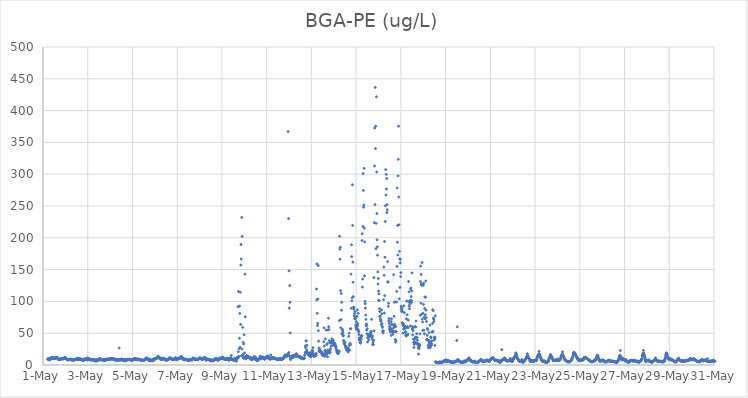
| Category | BGA-PE (ug/L) |
|---|---|
| 44317.208333333336 | 9.39 |
| 44317.21875 | 9.64 |
| 44317.229166666664 | 8.96 |
| 44317.239583333336 | 9.47 |
| 44317.25 | 9.08 |
| 44317.260416666664 | 10.12 |
| 44317.270833333336 | 9.42 |
| 44317.28125 | 8.56 |
| 44317.291666666664 | 8.02 |
| 44317.302083333336 | 8.27 |
| 44317.3125 | 8.7 |
| 44317.322916666664 | 8.48 |
| 44317.333333333336 | 9.2 |
| 44317.34375 | 9.77 |
| 44317.354166666664 | 10.43 |
| 44317.364583333336 | 11.96 |
| 44317.375 | 11.16 |
| 44317.385416666664 | 11.01 |
| 44317.395833333336 | 11.1 |
| 44317.40625 | 10.98 |
| 44317.416666666664 | 10.66 |
| 44317.427083333336 | 11.38 |
| 44317.4375 | 10.7 |
| 44317.447916666664 | 11.64 |
| 44317.458333333336 | 10.58 |
| 44317.46875 | 10.55 |
| 44317.479166666664 | 10.48 |
| 44317.489583333336 | 9.96 |
| 44317.5 | 10.61 |
| 44317.510416666664 | 10.6 |
| 44317.520833333336 | 10.1 |
| 44317.53125 | 10.48 |
| 44317.541666666664 | 10.48 |
| 44317.552083333336 | 11.65 |
| 44317.5625 | 11.7 |
| 44317.572916666664 | 11.52 |
| 44317.583333333336 | 11.71 |
| 44317.59375 | 11.9 |
| 44317.604166666664 | 12.23 |
| 44317.614583333336 | 11.11 |
| 44317.625 | 10.89 |
| 44317.635416666664 | 11.83 |
| 44317.645833333336 | 10.82 |
| 44317.65625 | 11 |
| 44317.666666666664 | 9.72 |
| 44317.677083333336 | 8.73 |
| 44317.6875 | 8.96 |
| 44317.697916666664 | 8.63 |
| 44317.708333333336 | 8.9 |
| 44317.71875 | 8.51 |
| 44317.729166666664 | 8.44 |
| 44317.739583333336 | 8.87 |
| 44317.75 | 8.63 |
| 44317.760416666664 | 8.33 |
| 44317.770833333336 | 9.34 |
| 44317.78125 | 9.35 |
| 44317.791666666664 | 10.35 |
| 44317.802083333336 | 9.73 |
| 44317.8125 | 9.58 |
| 44317.822916666664 | 9.8 |
| 44317.833333333336 | 10.14 |
| 44317.84375 | 10.01 |
| 44317.854166666664 | 9.89 |
| 44317.864583333336 | 9.53 |
| 44317.875 | 10.12 |
| 44317.885416666664 | 9.89 |
| 44317.895833333336 | 9.92 |
| 44317.90625 | 9.64 |
| 44317.916666666664 | 9.86 |
| 44317.927083333336 | 10.26 |
| 44317.9375 | 10.52 |
| 44317.947916666664 | 10.88 |
| 44317.958333333336 | 11.13 |
| 44317.96875 | 11.61 |
| 44317.979166666664 | 12.12 |
| 44317.989583333336 | 11.13 |
| 44318.0 | 10.84 |
| 44318.010416666664 | 10.72 |
| 44318.020833333336 | 10.18 |
| 44318.03125 | 10.63 |
| 44318.041666666664 | 10.05 |
| 44318.052083333336 | 9.77 |
| 44318.0625 | 9.56 |
| 44318.072916666664 | 8.69 |
| 44318.083333333336 | 8.94 |
| 44318.09375 | 8.46 |
| 44318.104166666664 | 8.33 |
| 44318.114583333336 | 8.38 |
| 44318.125 | 8.36 |
| 44318.135416666664 | 8.39 |
| 44318.145833333336 | 8.05 |
| 44318.15625 | 8.54 |
| 44318.166666666664 | 8.69 |
| 44318.177083333336 | 8.62 |
| 44318.1875 | 8.46 |
| 44318.197916666664 | 8.57 |
| 44318.208333333336 | 8.84 |
| 44318.21875 | 8.59 |
| 44318.229166666664 | 9.02 |
| 44318.239583333336 | 9.07 |
| 44318.25 | 8.12 |
| 44318.260416666664 | 8.74 |
| 44318.270833333336 | 8.68 |
| 44318.28125 | 8.13 |
| 44318.291666666664 | 7.83 |
| 44318.302083333336 | 7.79 |
| 44318.3125 | 7.96 |
| 44318.322916666664 | 7.49 |
| 44318.333333333336 | 8.03 |
| 44318.34375 | 7.77 |
| 44318.354166666664 | 7.76 |
| 44318.364583333336 | 7.58 |
| 44318.375 | 8.09 |
| 44318.385416666664 | 8.14 |
| 44318.395833333336 | 8.08 |
| 44318.40625 | 8.22 |
| 44318.416666666664 | 8.35 |
| 44318.427083333336 | 8.56 |
| 44318.4375 | 8.62 |
| 44318.447916666664 | 8.5 |
| 44318.458333333336 | 8.84 |
| 44318.46875 | 8.93 |
| 44318.479166666664 | 9.4 |
| 44318.489583333336 | 9.26 |
| 44318.5 | 9.62 |
| 44318.510416666664 | 9.72 |
| 44318.520833333336 | 9.36 |
| 44318.53125 | 10.66 |
| 44318.541666666664 | 9.24 |
| 44318.552083333336 | 9.44 |
| 44318.5625 | 8.23 |
| 44318.572916666664 | 8.8 |
| 44318.583333333336 | 9.35 |
| 44318.59375 | 9.99 |
| 44318.604166666664 | 9.1 |
| 44318.614583333336 | 9.08 |
| 44318.625 | 8.95 |
| 44318.635416666664 | 10.34 |
| 44318.645833333336 | 10.04 |
| 44318.65625 | 8.89 |
| 44318.666666666664 | 9.01 |
| 44318.677083333336 | 9.17 |
| 44318.6875 | 9.08 |
| 44318.697916666664 | 8.51 |
| 44318.708333333336 | 9.04 |
| 44318.71875 | 8.16 |
| 44318.729166666664 | 8.19 |
| 44318.739583333336 | 8.38 |
| 44318.75 | 8.14 |
| 44318.760416666664 | 7.8 |
| 44318.770833333336 | 8.87 |
| 44318.78125 | 8.46 |
| 44318.791666666664 | 9.16 |
| 44318.802083333336 | 7.08 |
| 44318.8125 | 8.73 |
| 44318.822916666664 | 8 |
| 44318.833333333336 | 7.89 |
| 44318.84375 | 9.18 |
| 44318.854166666664 | 9.13 |
| 44318.864583333336 | 8.08 |
| 44318.875 | 8.87 |
| 44318.885416666664 | 8.41 |
| 44318.895833333336 | 9.21 |
| 44318.90625 | 9.56 |
| 44318.916666666664 | 8.64 |
| 44318.927083333336 | 9.68 |
| 44318.9375 | 9.77 |
| 44318.947916666664 | 8.84 |
| 44318.958333333336 | 8.89 |
| 44318.96875 | 8.18 |
| 44318.979166666664 | 8.05 |
| 44318.989583333336 | 9.42 |
| 44319.0 | 11.28 |
| 44319.010416666664 | 10.03 |
| 44319.020833333336 | 10.27 |
| 44319.03125 | 9.99 |
| 44319.041666666664 | 9.34 |
| 44319.052083333336 | 9.57 |
| 44319.0625 | 8.93 |
| 44319.072916666664 | 8.22 |
| 44319.083333333336 | 9.4 |
| 44319.09375 | 9.24 |
| 44319.104166666664 | 8.79 |
| 44319.114583333336 | 8.56 |
| 44319.125 | 8.31 |
| 44319.135416666664 | 8.27 |
| 44319.145833333336 | 7.91 |
| 44319.15625 | 8.67 |
| 44319.166666666664 | 8.33 |
| 44319.177083333336 | 8.33 |
| 44319.1875 | 7.9 |
| 44319.197916666664 | 8.51 |
| 44319.208333333336 | 8.45 |
| 44319.21875 | 8.1 |
| 44319.229166666664 | 7.92 |
| 44319.239583333336 | 7.9 |
| 44319.25 | 7.92 |
| 44319.260416666664 | 8 |
| 44319.270833333336 | 7.72 |
| 44319.28125 | 8.25 |
| 44319.291666666664 | 8.02 |
| 44319.302083333336 | 7.67 |
| 44319.3125 | 7.74 |
| 44319.322916666664 | 7.67 |
| 44319.333333333336 | 6.54 |
| 44319.34375 | 7.55 |
| 44319.354166666664 | 7.79 |
| 44319.364583333336 | 5.83 |
| 44319.375 | 6.29 |
| 44319.385416666664 | 7.89 |
| 44319.395833333336 | 7.67 |
| 44319.40625 | 7.71 |
| 44319.416666666664 | 7.5 |
| 44319.427083333336 | 7.12 |
| 44319.4375 | 7.43 |
| 44319.447916666664 | 8.74 |
| 44319.458333333336 | 7.86 |
| 44319.46875 | 8.62 |
| 44319.479166666664 | 7.14 |
| 44319.489583333336 | 7.91 |
| 44319.5 | 9.04 |
| 44319.510416666664 | 9.52 |
| 44319.520833333336 | 9.45 |
| 44319.53125 | 9.75 |
| 44319.541666666664 | 9.85 |
| 44319.552083333336 | 9.77 |
| 44319.5625 | 9.92 |
| 44319.572916666664 | 9.69 |
| 44319.583333333336 | 8.22 |
| 44319.59375 | 8.35 |
| 44319.604166666664 | 7.99 |
| 44319.614583333336 | 8.07 |
| 44319.625 | 8.51 |
| 44319.635416666664 | 8.67 |
| 44319.645833333336 | 8.55 |
| 44319.65625 | 8.6 |
| 44319.666666666664 | 8.69 |
| 44319.677083333336 | 8.37 |
| 44319.6875 | 7.35 |
| 44319.697916666664 | 8.14 |
| 44319.708333333336 | 8.59 |
| 44319.71875 | 7.12 |
| 44319.729166666664 | 8.96 |
| 44319.739583333336 | 7.57 |
| 44319.75 | 7.39 |
| 44319.760416666664 | 6.94 |
| 44319.770833333336 | 7.99 |
| 44319.78125 | 7.23 |
| 44319.791666666664 | 7.81 |
| 44319.802083333336 | 7.6 |
| 44319.8125 | 7.93 |
| 44319.822916666664 | 8.99 |
| 44319.833333333336 | 8.84 |
| 44319.84375 | 9.17 |
| 44319.854166666664 | 9.12 |
| 44319.864583333336 | 8.51 |
| 44319.875 | 8.65 |
| 44319.885416666664 | 9.39 |
| 44319.895833333336 | 9.08 |
| 44319.90625 | 8.7 |
| 44319.916666666664 | 8.89 |
| 44319.927083333336 | 9.42 |
| 44319.9375 | 9.2 |
| 44319.947916666664 | 9.15 |
| 44319.958333333336 | 8.75 |
| 44319.96875 | 8.64 |
| 44319.979166666664 | 8.95 |
| 44319.989583333336 | 9.15 |
| 44320.0 | 9.46 |
| 44320.010416666664 | 10.17 |
| 44320.020833333336 | 10.05 |
| 44320.03125 | 10.26 |
| 44320.041666666664 | 9.76 |
| 44320.052083333336 | 9.65 |
| 44320.0625 | 9.62 |
| 44320.072916666664 | 9.64 |
| 44320.083333333336 | 9.24 |
| 44320.09375 | 9.47 |
| 44320.104166666664 | 9.56 |
| 44320.114583333336 | 9.75 |
| 44320.125 | 9.95 |
| 44320.135416666664 | 9.76 |
| 44320.145833333336 | 9.8 |
| 44320.15625 | 9.54 |
| 44320.166666666664 | 9.5 |
| 44320.177083333336 | 9.39 |
| 44320.1875 | 9.14 |
| 44320.197916666664 | 8.07 |
| 44320.208333333336 | 8.31 |
| 44320.21875 | 9.21 |
| 44320.229166666664 | 7.89 |
| 44320.239583333336 | 8.63 |
| 44320.25 | 7.59 |
| 44320.260416666664 | 8.52 |
| 44320.270833333336 | 9 |
| 44320.28125 | 8.43 |
| 44320.291666666664 | 7.21 |
| 44320.302083333336 | 7.97 |
| 44320.3125 | 7.82 |
| 44320.322916666664 | 7.57 |
| 44320.333333333336 | 8.55 |
| 44320.34375 | 8.37 |
| 44320.354166666664 | 8.14 |
| 44320.364583333336 | 7.91 |
| 44320.375 | 8.23 |
| 44320.385416666664 | 8.02 |
| 44320.395833333336 | 8.25 |
| 44320.40625 | 26.69 |
| 44320.416666666664 | 8.24 |
| 44320.427083333336 | 8.23 |
| 44320.4375 | 7.66 |
| 44320.447916666664 | 7.56 |
| 44320.458333333336 | 7.82 |
| 44320.46875 | 8.31 |
| 44320.479166666664 | 8.38 |
| 44320.489583333336 | 8.52 |
| 44320.5 | 8.95 |
| 44320.510416666664 | 9.39 |
| 44320.520833333336 | 9.39 |
| 44320.53125 | 8.98 |
| 44320.541666666664 | 8.19 |
| 44320.552083333336 | 8.09 |
| 44320.5625 | 7.14 |
| 44320.572916666664 | 8.58 |
| 44320.583333333336 | 8.03 |
| 44320.59375 | 7.93 |
| 44320.604166666664 | 8.01 |
| 44320.614583333336 | 8.45 |
| 44320.625 | 7.73 |
| 44320.635416666664 | 7.51 |
| 44320.645833333336 | 7.84 |
| 44320.65625 | 6.72 |
| 44320.666666666664 | 7.82 |
| 44320.677083333336 | 6.4 |
| 44320.6875 | 7.2 |
| 44320.697916666664 | 8.9 |
| 44320.708333333336 | 7.66 |
| 44320.71875 | 8.07 |
| 44320.729166666664 | 7.39 |
| 44320.739583333336 | 8.44 |
| 44320.75 | 7.53 |
| 44320.760416666664 | 8.5 |
| 44320.770833333336 | 8.88 |
| 44320.78125 | 8.29 |
| 44320.791666666664 | 8.65 |
| 44320.802083333336 | 8.51 |
| 44320.8125 | 8.65 |
| 44320.822916666664 | 8.65 |
| 44320.833333333336 | 8.71 |
| 44320.84375 | 8.76 |
| 44320.854166666664 | 8.9 |
| 44320.864583333336 | 9.4 |
| 44320.875 | 8.18 |
| 44320.885416666664 | 8.29 |
| 44320.895833333336 | 8.45 |
| 44320.90625 | 8.22 |
| 44320.916666666664 | 8.6 |
| 44320.927083333336 | 8.5 |
| 44320.9375 | 8.54 |
| 44320.947916666664 | 7.93 |
| 44320.958333333336 | 8.3 |
| 44320.96875 | 6.59 |
| 44320.979166666664 | 6.88 |
| 44320.989583333336 | 8.51 |
| 44321.0 | 7.9 |
| 44321.010416666664 | 8.58 |
| 44321.020833333336 | 8.42 |
| 44321.03125 | 8.62 |
| 44321.041666666664 | 8.89 |
| 44321.052083333336 | 9.07 |
| 44321.0625 | 9.32 |
| 44321.072916666664 | 9.48 |
| 44321.083333333336 | 9.5 |
| 44321.09375 | 10.14 |
| 44321.104166666664 | 10.39 |
| 44321.114583333336 | 9.22 |
| 44321.125 | 9.02 |
| 44321.135416666664 | 9.12 |
| 44321.145833333336 | 9.17 |
| 44321.15625 | 8.56 |
| 44321.166666666664 | 9.28 |
| 44321.177083333336 | 8.74 |
| 44321.1875 | 9.49 |
| 44321.197916666664 | 9.09 |
| 44321.208333333336 | 9.22 |
| 44321.21875 | 9.21 |
| 44321.229166666664 | 9.13 |
| 44321.239583333336 | 7.6 |
| 44321.25 | 9.34 |
| 44321.260416666664 | 8.93 |
| 44321.270833333336 | 8.8 |
| 44321.28125 | 8.81 |
| 44321.291666666664 | 8.92 |
| 44321.302083333336 | 8.63 |
| 44321.3125 | 8.67 |
| 44321.322916666664 | 8.28 |
| 44321.333333333336 | 8.47 |
| 44321.34375 | 8.45 |
| 44321.354166666664 | 8.48 |
| 44321.364583333336 | 8.14 |
| 44321.375 | 7.25 |
| 44321.385416666664 | 7.36 |
| 44321.395833333336 | 7.28 |
| 44321.40625 | 7.7 |
| 44321.416666666664 | 7.7 |
| 44321.427083333336 | 7.21 |
| 44321.4375 | 7.4 |
| 44321.447916666664 | 7.32 |
| 44321.458333333336 | 7.07 |
| 44321.46875 | 7.3 |
| 44321.479166666664 | 7.49 |
| 44321.489583333336 | 7.37 |
| 44321.5 | 7.35 |
| 44321.510416666664 | 7.54 |
| 44321.520833333336 | 7.61 |
| 44321.53125 | 7.99 |
| 44321.541666666664 | 8.53 |
| 44321.552083333336 | 8.78 |
| 44321.5625 | 8.44 |
| 44321.572916666664 | 9.69 |
| 44321.583333333336 | 9.66 |
| 44321.59375 | 9.13 |
| 44321.604166666664 | 10.03 |
| 44321.614583333336 | 9.61 |
| 44321.625 | 11.25 |
| 44321.635416666664 | 10.17 |
| 44321.645833333336 | 10.94 |
| 44321.65625 | 10.01 |
| 44321.666666666664 | 9.87 |
| 44321.677083333336 | 8.99 |
| 44321.6875 | 9.14 |
| 44321.697916666664 | 8.61 |
| 44321.708333333336 | 8.33 |
| 44321.71875 | 8.37 |
| 44321.729166666664 | 9.06 |
| 44321.739583333336 | 6.73 |
| 44321.75 | 8.88 |
| 44321.760416666664 | 8.2 |
| 44321.770833333336 | 9.14 |
| 44321.78125 | 9.18 |
| 44321.791666666664 | 7.44 |
| 44321.802083333336 | 6.64 |
| 44321.8125 | 6.59 |
| 44321.822916666664 | 6.48 |
| 44321.833333333336 | 7.14 |
| 44321.84375 | 7.12 |
| 44321.854166666664 | 6.98 |
| 44321.864583333336 | 7.42 |
| 44321.875 | 8.03 |
| 44321.885416666664 | 6.97 |
| 44321.895833333336 | 7.14 |
| 44321.90625 | 7.97 |
| 44321.916666666664 | 8.5 |
| 44321.927083333336 | 8.47 |
| 44321.9375 | 6.65 |
| 44321.947916666664 | 8.88 |
| 44321.958333333336 | 9.26 |
| 44321.96875 | 9.87 |
| 44321.979166666664 | 9.58 |
| 44321.989583333336 | 10 |
| 44322.0 | 9.05 |
| 44322.010416666664 | 10 |
| 44322.020833333336 | 9.99 |
| 44322.03125 | 9.52 |
| 44322.041666666664 | 9.77 |
| 44322.052083333336 | 10.06 |
| 44322.0625 | 10.43 |
| 44322.072916666664 | 10.48 |
| 44322.083333333336 | 10.69 |
| 44322.09375 | 11.31 |
| 44322.104166666664 | 11.33 |
| 44322.114583333336 | 11.55 |
| 44322.125 | 12.28 |
| 44322.135416666664 | 12.04 |
| 44322.145833333336 | 14.06 |
| 44322.15625 | 13.2 |
| 44322.166666666664 | 12.83 |
| 44322.177083333336 | 11.93 |
| 44322.1875 | 11.11 |
| 44322.197916666664 | 10.93 |
| 44322.208333333336 | 10.69 |
| 44322.21875 | 10.77 |
| 44322.229166666664 | 9.99 |
| 44322.239583333336 | 9.17 |
| 44322.25 | 10.74 |
| 44322.260416666664 | 10.67 |
| 44322.270833333336 | 10.58 |
| 44322.28125 | 10.1 |
| 44322.291666666664 | 8.63 |
| 44322.302083333336 | 8.94 |
| 44322.3125 | 10.47 |
| 44322.322916666664 | 9.86 |
| 44322.333333333336 | 10.18 |
| 44322.34375 | 8.82 |
| 44322.354166666664 | 10.5 |
| 44322.364583333336 | 9.6 |
| 44322.375 | 10.34 |
| 44322.385416666664 | 9.68 |
| 44322.395833333336 | 9.64 |
| 44322.40625 | 9.99 |
| 44322.416666666664 | 10.17 |
| 44322.427083333336 | 9.89 |
| 44322.4375 | 9.72 |
| 44322.447916666664 | 9.22 |
| 44322.458333333336 | 8.77 |
| 44322.46875 | 8.04 |
| 44322.479166666664 | 8.74 |
| 44322.489583333336 | 8.37 |
| 44322.5 | 7.48 |
| 44322.510416666664 | 7.54 |
| 44322.520833333336 | 7.63 |
| 44322.53125 | 7.57 |
| 44322.541666666664 | 7.35 |
| 44322.552083333336 | 9 |
| 44322.5625 | 8.6 |
| 44322.572916666664 | 8.56 |
| 44322.583333333336 | 8.83 |
| 44322.59375 | 8.96 |
| 44322.604166666664 | 9.72 |
| 44322.614583333336 | 9.04 |
| 44322.625 | 9.23 |
| 44322.635416666664 | 9.4 |
| 44322.645833333336 | 10.45 |
| 44322.65625 | 10.19 |
| 44322.666666666664 | 11.75 |
| 44322.677083333336 | 10.31 |
| 44322.6875 | 10.37 |
| 44322.697916666664 | 10.81 |
| 44322.708333333336 | 10.44 |
| 44322.71875 | 10.28 |
| 44322.729166666664 | 10.39 |
| 44322.739583333336 | 9.85 |
| 44322.75 | 9.69 |
| 44322.760416666664 | 8.72 |
| 44322.770833333336 | 9.08 |
| 44322.78125 | 9.66 |
| 44322.791666666664 | 8.78 |
| 44322.802083333336 | 9.05 |
| 44322.8125 | 8.43 |
| 44322.822916666664 | 8.45 |
| 44322.833333333336 | 8.49 |
| 44322.84375 | 9.12 |
| 44322.854166666664 | 8.74 |
| 44322.864583333336 | 9.5 |
| 44322.875 | 9.36 |
| 44322.885416666664 | 9.57 |
| 44322.895833333336 | 9.27 |
| 44322.90625 | 10.07 |
| 44322.916666666664 | 9.29 |
| 44322.927083333336 | 11.81 |
| 44322.9375 | 10.36 |
| 44322.947916666664 | 9.69 |
| 44322.958333333336 | 9.78 |
| 44322.96875 | 9.54 |
| 44322.979166666664 | 8.15 |
| 44322.989583333336 | 8.31 |
| 44323.0 | 9.38 |
| 44323.010416666664 | 9.95 |
| 44323.020833333336 | 10.2 |
| 44323.03125 | 10.37 |
| 44323.041666666664 | 11 |
| 44323.052083333336 | 9.66 |
| 44323.0625 | 9.82 |
| 44323.072916666664 | 10.38 |
| 44323.083333333336 | 10.25 |
| 44323.09375 | 10.97 |
| 44323.104166666664 | 10.55 |
| 44323.114583333336 | 10.79 |
| 44323.125 | 10.72 |
| 44323.135416666664 | 10.96 |
| 44323.145833333336 | 11.46 |
| 44323.15625 | 11.03 |
| 44323.166666666664 | 11.79 |
| 44323.177083333336 | 13.34 |
| 44323.1875 | 13.35 |
| 44323.197916666664 | 12.2 |
| 44323.208333333336 | 11.22 |
| 44323.21875 | 11.35 |
| 44323.229166666664 | 10.44 |
| 44323.239583333336 | 10.16 |
| 44323.25 | 10.44 |
| 44323.260416666664 | 9.45 |
| 44323.270833333336 | 9.44 |
| 44323.28125 | 8.37 |
| 44323.291666666664 | 9.7 |
| 44323.302083333336 | 9.33 |
| 44323.3125 | 9.14 |
| 44323.322916666664 | 7.82 |
| 44323.333333333336 | 9.36 |
| 44323.34375 | 8.84 |
| 44323.354166666664 | 8.76 |
| 44323.364583333336 | 8.41 |
| 44323.375 | 8.89 |
| 44323.385416666664 | 8.83 |
| 44323.395833333336 | 8.42 |
| 44323.40625 | 8.85 |
| 44323.416666666664 | 8.85 |
| 44323.427083333336 | 7.85 |
| 44323.4375 | 7.98 |
| 44323.447916666664 | 8.14 |
| 44323.458333333336 | 7.87 |
| 44323.46875 | 7.76 |
| 44323.479166666664 | 7.3 |
| 44323.489583333336 | 7.53 |
| 44323.5 | 8.06 |
| 44323.510416666664 | 7.41 |
| 44323.520833333336 | 7.56 |
| 44323.53125 | 8.02 |
| 44323.541666666664 | 7.88 |
| 44323.552083333336 | 7.4 |
| 44323.5625 | 7.96 |
| 44323.572916666664 | 7.93 |
| 44323.583333333336 | 8.31 |
| 44323.59375 | 8.26 |
| 44323.604166666664 | 8.78 |
| 44323.614583333336 | 8.92 |
| 44323.625 | 8.65 |
| 44323.635416666664 | 8.29 |
| 44323.645833333336 | 8.66 |
| 44323.65625 | 7.76 |
| 44323.666666666664 | 7.74 |
| 44323.677083333336 | 9.05 |
| 44323.6875 | 9.5 |
| 44323.697916666664 | 11.15 |
| 44323.708333333336 | 10.29 |
| 44323.71875 | 10.16 |
| 44323.729166666664 | 10.2 |
| 44323.739583333336 | 10.15 |
| 44323.75 | 10.54 |
| 44323.760416666664 | 10.25 |
| 44323.770833333336 | 9.97 |
| 44323.78125 | 9.49 |
| 44323.791666666664 | 8.95 |
| 44323.802083333336 | 8.96 |
| 44323.8125 | 9.16 |
| 44323.822916666664 | 8.91 |
| 44323.833333333336 | 8.56 |
| 44323.84375 | 9.24 |
| 44323.854166666664 | 9.02 |
| 44323.864583333336 | 9.17 |
| 44323.875 | 8.71 |
| 44323.885416666664 | 8.9 |
| 44323.895833333336 | 8.94 |
| 44323.90625 | 8.96 |
| 44323.916666666664 | 8.58 |
| 44323.927083333336 | 8.73 |
| 44323.9375 | 9.02 |
| 44323.947916666664 | 8.97 |
| 44323.958333333336 | 9.55 |
| 44323.96875 | 10.14 |
| 44323.979166666664 | 10.58 |
| 44323.989583333336 | 10.17 |
| 44324.0 | 11.42 |
| 44324.010416666664 | 10.42 |
| 44324.020833333336 | 10.49 |
| 44324.03125 | 10.42 |
| 44324.041666666664 | 10.47 |
| 44324.052083333336 | 10.58 |
| 44324.0625 | 10.77 |
| 44324.072916666664 | 10.42 |
| 44324.083333333336 | 8.7 |
| 44324.09375 | 9.58 |
| 44324.104166666664 | 10.24 |
| 44324.114583333336 | 9.77 |
| 44324.125 | 10.02 |
| 44324.135416666664 | 9.06 |
| 44324.145833333336 | 9.69 |
| 44324.15625 | 9.21 |
| 44324.166666666664 | 9.94 |
| 44324.177083333336 | 9.95 |
| 44324.1875 | 9.58 |
| 44324.197916666664 | 10.21 |
| 44324.208333333336 | 11.94 |
| 44324.21875 | 11.43 |
| 44324.229166666664 | 11.08 |
| 44324.239583333336 | 11.02 |
| 44324.25 | 11.13 |
| 44324.260416666664 | 10.35 |
| 44324.270833333336 | 10.05 |
| 44324.28125 | 9.8 |
| 44324.291666666664 | 7.83 |
| 44324.302083333336 | 7.46 |
| 44324.3125 | 8.33 |
| 44324.322916666664 | 8.9 |
| 44324.333333333336 | 9.27 |
| 44324.34375 | 8.92 |
| 44324.354166666664 | 9.1 |
| 44324.364583333336 | 8.94 |
| 44324.375 | 8.64 |
| 44324.385416666664 | 8.89 |
| 44324.395833333336 | 8.83 |
| 44324.40625 | 8.39 |
| 44324.416666666664 | 8.39 |
| 44324.427083333336 | 8.43 |
| 44324.4375 | 8.23 |
| 44324.447916666664 | 8.1 |
| 44324.458333333336 | 6.89 |
| 44324.46875 | 7.52 |
| 44324.479166666664 | 7.68 |
| 44324.489583333336 | 7.75 |
| 44324.5 | 7.6 |
| 44324.510416666664 | 7.62 |
| 44324.520833333336 | 7.26 |
| 44324.53125 | 7.64 |
| 44324.541666666664 | 6.73 |
| 44324.552083333336 | 8.11 |
| 44324.5625 | 7.58 |
| 44324.572916666664 | 6.42 |
| 44324.583333333336 | 6.92 |
| 44324.59375 | 7.03 |
| 44324.604166666664 | 7.39 |
| 44324.614583333336 | 7.52 |
| 44324.625 | 7.75 |
| 44324.635416666664 | 8.33 |
| 44324.645833333336 | 8.01 |
| 44324.65625 | 8.17 |
| 44324.666666666664 | 8.38 |
| 44324.677083333336 | 7.89 |
| 44324.6875 | 8.92 |
| 44324.697916666664 | 9.54 |
| 44324.708333333336 | 10.06 |
| 44324.71875 | 8.78 |
| 44324.729166666664 | 9.71 |
| 44324.739583333336 | 9.54 |
| 44324.75 | 10.37 |
| 44324.760416666664 | 9.57 |
| 44324.770833333336 | 8.84 |
| 44324.78125 | 8.92 |
| 44324.791666666664 | 8.31 |
| 44324.802083333336 | 8.08 |
| 44324.8125 | 8.01 |
| 44324.822916666664 | 7.93 |
| 44324.833333333336 | 8.14 |
| 44324.84375 | 7.81 |
| 44324.854166666664 | 7.91 |
| 44324.864583333336 | 8.59 |
| 44324.875 | 10.13 |
| 44324.885416666664 | 10.55 |
| 44324.895833333336 | 10.37 |
| 44324.90625 | 9.96 |
| 44324.916666666664 | 10.05 |
| 44324.927083333336 | 10.06 |
| 44324.9375 | 9.81 |
| 44324.947916666664 | 10.55 |
| 44324.958333333336 | 10.68 |
| 44324.96875 | 10.89 |
| 44324.979166666664 | 10.62 |
| 44324.989583333336 | 11.21 |
| 44325.0 | 11.43 |
| 44325.010416666664 | 12.55 |
| 44325.020833333336 | 9.96 |
| 44325.03125 | 11.33 |
| 44325.041666666664 | 11.61 |
| 44325.052083333336 | 11.2 |
| 44325.0625 | 10.02 |
| 44325.072916666664 | 10.69 |
| 44325.083333333336 | 10.03 |
| 44325.09375 | 9.27 |
| 44325.104166666664 | 10.13 |
| 44325.114583333336 | 8.76 |
| 44325.125 | 9.51 |
| 44325.135416666664 | 9.26 |
| 44325.145833333336 | 8.97 |
| 44325.15625 | 9.14 |
| 44325.166666666664 | 8.94 |
| 44325.177083333336 | 9.21 |
| 44325.1875 | 9.25 |
| 44325.197916666664 | 9.28 |
| 44325.208333333336 | 9.91 |
| 44325.21875 | 9.22 |
| 44325.229166666664 | 9.03 |
| 44325.239583333336 | 8.64 |
| 44325.25 | 9.17 |
| 44325.260416666664 | 10.91 |
| 44325.270833333336 | 9.49 |
| 44325.28125 | 9.54 |
| 44325.291666666664 | 8.7 |
| 44325.302083333336 | 7.93 |
| 44325.3125 | 7.46 |
| 44325.322916666664 | 7.97 |
| 44325.333333333336 | 8.37 |
| 44325.34375 | 9.74 |
| 44325.354166666664 | 10.75 |
| 44325.364583333336 | 9.31 |
| 44325.375 | 9.92 |
| 44325.385416666664 | 10.1 |
| 44325.395833333336 | 10.25 |
| 44325.40625 | 10.85 |
| 44325.416666666664 | 14.81 |
| 44325.427083333336 | 10.08 |
| 44325.4375 | 9.54 |
| 44325.447916666664 | 9.17 |
| 44325.458333333336 | 9.07 |
| 44325.46875 | 8.17 |
| 44325.479166666664 | 8.41 |
| 44325.489583333336 | 8.59 |
| 44325.5 | 8.1 |
| 44325.510416666664 | 8.09 |
| 44325.520833333336 | 7.75 |
| 44325.53125 | 7.47 |
| 44325.541666666664 | 7.63 |
| 44325.552083333336 | 8 |
| 44325.5625 | 8.15 |
| 44325.572916666664 | 10.79 |
| 44325.583333333336 | 8.32 |
| 44325.59375 | 8.58 |
| 44325.604166666664 | 7.84 |
| 44325.614583333336 | 7.53 |
| 44325.625 | 6.17 |
| 44325.635416666664 | 6.53 |
| 44325.645833333336 | 6.42 |
| 44325.65625 | 10.03 |
| 44325.666666666664 | 9.48 |
| 44325.677083333336 | 10.43 |
| 44325.6875 | 11.86 |
| 44325.697916666664 | 12.06 |
| 44325.708333333336 | 10.51 |
| 44325.71875 | 91.68 |
| 44325.729166666664 | 20.78 |
| 44325.739583333336 | 115.43 |
| 44325.75 | 13.5 |
| 44325.760416666664 | 12.84 |
| 44325.770833333336 | 25.71 |
| 44325.78125 | 42.04 |
| 44325.791666666664 | 92.45 |
| 44325.802083333336 | 81.07 |
| 44325.8125 | 27.67 |
| 44325.822916666664 | 114.4 |
| 44325.833333333336 | 63.78 |
| 44325.84375 | 157.18 |
| 44325.854166666664 | 189.46 |
| 44325.864583333336 | 166.7 |
| 44325.875 | 14.45 |
| 44325.885416666664 | 232.07 |
| 44325.895833333336 | 25.12 |
| 44325.90625 | 202.11 |
| 44325.916666666664 | 15.08 |
| 44325.927083333336 | 59.18 |
| 44325.9375 | 16.49 |
| 44325.947916666664 | 35.67 |
| 44325.958333333336 | 10.73 |
| 44325.96875 | 11.36 |
| 44325.979166666664 | 32.94 |
| 44325.989583333336 | 47.65 |
| 44326.0 | 11.47 |
| 44326.010416666664 | 19.05 |
| 44326.020833333336 | 12.42 |
| 44326.03125 | 142.81 |
| 44326.041666666664 | 75.79 |
| 44326.052083333336 | 11.66 |
| 44326.0625 | 9.56 |
| 44326.072916666664 | 12.07 |
| 44326.083333333336 | 12.13 |
| 44326.09375 | 14.48 |
| 44326.104166666664 | 14.92 |
| 44326.114583333336 | 13.04 |
| 44326.125 | 11.71 |
| 44326.135416666664 | 12.42 |
| 44326.145833333336 | 11.72 |
| 44326.15625 | 14.04 |
| 44326.166666666664 | 12.32 |
| 44326.177083333336 | 13.23 |
| 44326.1875 | 12.06 |
| 44326.197916666664 | 11.8 |
| 44326.208333333336 | 12.28 |
| 44326.21875 | 11.76 |
| 44326.229166666664 | 11.11 |
| 44326.239583333336 | 11.25 |
| 44326.25 | 12.11 |
| 44326.260416666664 | 12.15 |
| 44326.270833333336 | 9.62 |
| 44326.28125 | 9.21 |
| 44326.291666666664 | 11.11 |
| 44326.302083333336 | 10.68 |
| 44326.3125 | 9.99 |
| 44326.322916666664 | 10.68 |
| 44326.333333333336 | 8.17 |
| 44326.34375 | 8.39 |
| 44326.354166666664 | 8.88 |
| 44326.364583333336 | 10.6 |
| 44326.375 | 10.07 |
| 44326.385416666664 | 9.9 |
| 44326.395833333336 | 10.03 |
| 44326.40625 | 10.44 |
| 44326.416666666664 | 10.17 |
| 44326.427083333336 | 9.99 |
| 44326.4375 | 13.24 |
| 44326.447916666664 | 9.79 |
| 44326.458333333336 | 9.4 |
| 44326.46875 | 9.4 |
| 44326.479166666664 | 9.93 |
| 44326.489583333336 | 12.66 |
| 44326.5 | 10.25 |
| 44326.510416666664 | 11.23 |
| 44326.520833333336 | 9.68 |
| 44326.53125 | 8.44 |
| 44326.541666666664 | 9.64 |
| 44326.552083333336 | 7.12 |
| 44326.5625 | 7.83 |
| 44326.572916666664 | 7.41 |
| 44326.583333333336 | 8.05 |
| 44326.59375 | 6.9 |
| 44326.604166666664 | 7.37 |
| 44326.614583333336 | 7.83 |
| 44326.625 | 9.13 |
| 44326.635416666664 | 8.61 |
| 44326.645833333336 | 9.63 |
| 44326.65625 | 9.89 |
| 44326.666666666664 | 10.18 |
| 44326.677083333336 | 9.58 |
| 44326.6875 | 11.07 |
| 44326.697916666664 | 11.23 |
| 44326.708333333336 | 13.98 |
| 44326.71875 | 11.89 |
| 44326.729166666664 | 11.66 |
| 44326.739583333336 | 12.04 |
| 44326.75 | 11.21 |
| 44326.760416666664 | 11.43 |
| 44326.770833333336 | 9.79 |
| 44326.78125 | 11.42 |
| 44326.791666666664 | 12.8 |
| 44326.802083333336 | 12.45 |
| 44326.8125 | 11.44 |
| 44326.822916666664 | 11.71 |
| 44326.833333333336 | 11.28 |
| 44326.84375 | 11.3 |
| 44326.854166666664 | 12.42 |
| 44326.864583333336 | 11.77 |
| 44326.875 | 10.44 |
| 44326.885416666664 | 10.7 |
| 44326.895833333336 | 10.12 |
| 44326.90625 | 9.43 |
| 44326.916666666664 | 9.22 |
| 44326.927083333336 | 9.95 |
| 44326.9375 | 10.63 |
| 44326.947916666664 | 12.04 |
| 44326.958333333336 | 10.81 |
| 44326.96875 | 11.94 |
| 44326.979166666664 | 11.49 |
| 44326.989583333336 | 11.78 |
| 44327.0 | 13.03 |
| 44327.010416666664 | 12.99 |
| 44327.020833333336 | 14.08 |
| 44327.03125 | 12.96 |
| 44327.041666666664 | 12.23 |
| 44327.052083333336 | 13.89 |
| 44327.0625 | 10.65 |
| 44327.072916666664 | 13.03 |
| 44327.083333333336 | 13.63 |
| 44327.09375 | 11.61 |
| 44327.104166666664 | 10.5 |
| 44327.114583333336 | 11.01 |
| 44327.125 | 11.14 |
| 44327.135416666664 | 10.23 |
| 44327.145833333336 | 9.74 |
| 44327.15625 | 8.94 |
| 44327.166666666664 | 9.62 |
| 44327.177083333336 | 9.19 |
| 44327.1875 | 15.84 |
| 44327.197916666664 | 10.88 |
| 44327.208333333336 | 11.18 |
| 44327.21875 | 10.63 |
| 44327.229166666664 | 11.35 |
| 44327.239583333336 | 11.36 |
| 44327.25 | 10.99 |
| 44327.260416666664 | 11.63 |
| 44327.270833333336 | 11.16 |
| 44327.28125 | 11.14 |
| 44327.291666666664 | 11.12 |
| 44327.302083333336 | 9.96 |
| 44327.3125 | 11.27 |
| 44327.322916666664 | 11.14 |
| 44327.333333333336 | 10.7 |
| 44327.34375 | 10.95 |
| 44327.354166666664 | 9.89 |
| 44327.364583333336 | 10.33 |
| 44327.375 | 10.14 |
| 44327.385416666664 | 10.28 |
| 44327.395833333336 | 10.2 |
| 44327.40625 | 9.93 |
| 44327.416666666664 | 10.17 |
| 44327.427083333336 | 9.92 |
| 44327.4375 | 9.43 |
| 44327.447916666664 | 8.83 |
| 44327.458333333336 | 9 |
| 44327.46875 | 8.54 |
| 44327.479166666664 | 8.81 |
| 44327.489583333336 | 8.43 |
| 44327.5 | 8.34 |
| 44327.510416666664 | 8.8 |
| 44327.520833333336 | 8.8 |
| 44327.53125 | 9.74 |
| 44327.541666666664 | 9.64 |
| 44327.552083333336 | 9.59 |
| 44327.5625 | 9.97 |
| 44327.572916666664 | 9.47 |
| 44327.583333333336 | 10.03 |
| 44327.59375 | 9.74 |
| 44327.604166666664 | 8.57 |
| 44327.614583333336 | 9.23 |
| 44327.625 | 9.88 |
| 44327.635416666664 | 9.91 |
| 44327.645833333336 | 8.89 |
| 44327.65625 | 8.71 |
| 44327.666666666664 | 8.6 |
| 44327.677083333336 | 9.55 |
| 44327.6875 | 8.58 |
| 44327.697916666664 | 9.34 |
| 44327.708333333336 | 9.38 |
| 44327.71875 | 10.14 |
| 44327.729166666664 | 10.73 |
| 44327.739583333336 | 9.97 |
| 44327.75 | 10.49 |
| 44327.760416666664 | 11.76 |
| 44327.770833333336 | 10.74 |
| 44327.78125 | 12.62 |
| 44327.791666666664 | 12.66 |
| 44327.802083333336 | 14.33 |
| 44327.8125 | 14.79 |
| 44327.822916666664 | 14.43 |
| 44327.833333333336 | 14.04 |
| 44327.84375 | 14.28 |
| 44327.854166666664 | 15.59 |
| 44327.864583333336 | 14.45 |
| 44327.875 | 14.59 |
| 44327.885416666664 | 15.81 |
| 44327.895833333336 | 14.54 |
| 44327.90625 | 13.73 |
| 44327.916666666664 | 15.08 |
| 44327.927083333336 | 14.33 |
| 44327.9375 | 16.52 |
| 44327.947916666664 | 14.85 |
| 44327.958333333336 | 367.02 |
| 44327.96875 | 16.98 |
| 44327.979166666664 | 230.15 |
| 44327.989583333336 | 19.58 |
| 44328.0 | 147.97 |
| 44328.010416666664 | 89.3 |
| 44328.020833333336 | 14.77 |
| 44328.03125 | 124.9 |
| 44328.041666666664 | 98.5 |
| 44328.052083333336 | 50.53 |
| 44328.0625 | 11.23 |
| 44328.072916666664 | 8.52 |
| 44328.083333333336 | 10.97 |
| 44328.09375 | 10.25 |
| 44328.104166666664 | 10.47 |
| 44328.114583333336 | 11.72 |
| 44328.125 | 13.27 |
| 44328.135416666664 | 12.21 |
| 44328.145833333336 | 14.13 |
| 44328.15625 | 12.85 |
| 44328.166666666664 | 12.24 |
| 44328.177083333336 | 14.76 |
| 44328.1875 | 12.13 |
| 44328.197916666664 | 12.54 |
| 44328.208333333336 | 13.56 |
| 44328.21875 | 14.85 |
| 44328.229166666664 | 14.91 |
| 44328.239583333336 | 14.8 |
| 44328.25 | 13.97 |
| 44328.260416666664 | 13.63 |
| 44328.270833333336 | 15.38 |
| 44328.28125 | 15.26 |
| 44328.291666666664 | 15.68 |
| 44328.302083333336 | 15.15 |
| 44328.3125 | 17.24 |
| 44328.322916666664 | 17.69 |
| 44328.333333333336 | 16.82 |
| 44328.34375 | 14.37 |
| 44328.354166666664 | 13.71 |
| 44328.364583333336 | 14.06 |
| 44328.375 | 13.7 |
| 44328.385416666664 | 13.4 |
| 44328.395833333336 | 13.48 |
| 44328.40625 | 14.43 |
| 44328.416666666664 | 13.41 |
| 44328.427083333336 | 13.34 |
| 44328.4375 | 13.27 |
| 44328.447916666664 | 12.85 |
| 44328.458333333336 | 13.58 |
| 44328.46875 | 12.02 |
| 44328.479166666664 | 12.19 |
| 44328.489583333336 | 13.06 |
| 44328.5 | 11.95 |
| 44328.510416666664 | 11.08 |
| 44328.520833333336 | 11.98 |
| 44328.53125 | 11.14 |
| 44328.541666666664 | 12 |
| 44328.552083333336 | 12.02 |
| 44328.5625 | 11.66 |
| 44328.572916666664 | 11.25 |
| 44328.583333333336 | 10.6 |
| 44328.59375 | 10.78 |
| 44328.604166666664 | 10.41 |
| 44328.614583333336 | 9.87 |
| 44328.625 | 10.35 |
| 44328.635416666664 | 10.11 |
| 44328.645833333336 | 10.22 |
| 44328.65625 | 9.7 |
| 44328.666666666664 | 10.88 |
| 44328.677083333336 | 10.27 |
| 44328.6875 | 10.95 |
| 44328.697916666664 | 15.55 |
| 44328.708333333336 | 15.46 |
| 44328.71875 | 19.57 |
| 44328.729166666664 | 30.09 |
| 44328.739583333336 | 27.27 |
| 44328.75 | 20.15 |
| 44328.760416666664 | 38.03 |
| 44328.770833333336 | 37.87 |
| 44328.78125 | 20.62 |
| 44328.791666666664 | 23.49 |
| 44328.802083333336 | 30.86 |
| 44328.8125 | 19.01 |
| 44328.822916666664 | 20.14 |
| 44328.833333333336 | 18.05 |
| 44328.84375 | 17.99 |
| 44328.854166666664 | 17.57 |
| 44328.864583333336 | 16.05 |
| 44328.875 | 15.83 |
| 44328.885416666664 | 15.66 |
| 44328.895833333336 | 15.88 |
| 44328.90625 | 15.2 |
| 44328.916666666664 | 15.5 |
| 44328.927083333336 | 15.6 |
| 44328.9375 | 17.53 |
| 44328.947916666664 | 19.4 |
| 44328.958333333336 | 13.61 |
| 44328.96875 | 13.08 |
| 44328.979166666664 | 14.39 |
| 44328.989583333336 | 13.11 |
| 44329.0 | 14.7 |
| 44329.010416666664 | 16.13 |
| 44329.020833333336 | 15.45 |
| 44329.03125 | 22.87 |
| 44329.041666666664 | 17.06 |
| 44329.052083333336 | 21.96 |
| 44329.0625 | 20.05 |
| 44329.072916666664 | 27.27 |
| 44329.083333333336 | 16.84 |
| 44329.09375 | 15.64 |
| 44329.104166666664 | 15.9 |
| 44329.114583333336 | 13.35 |
| 44329.125 | 15.11 |
| 44329.135416666664 | 14.53 |
| 44329.145833333336 | 13.94 |
| 44329.15625 | 16.34 |
| 44329.166666666664 | 16.19 |
| 44329.177083333336 | 15.45 |
| 44329.1875 | 17.3 |
| 44329.197916666664 | 14.74 |
| 44329.208333333336 | 15.19 |
| 44329.21875 | 18.01 |
| 44329.229166666664 | 119.52 |
| 44329.239583333336 | 102.37 |
| 44329.25 | 159.07 |
| 44329.260416666664 | 81.35 |
| 44329.270833333336 | 61.97 |
| 44329.28125 | 65.5 |
| 44329.291666666664 | 103.95 |
| 44329.302083333336 | 156.3 |
| 44329.3125 | 54.08 |
| 44329.322916666664 | 37.54 |
| 44329.333333333336 | 26.76 |
| 44329.34375 | 21.39 |
| 44329.354166666664 | 22.41 |
| 44329.364583333336 | 24.43 |
| 44329.375 | 25.22 |
| 44329.385416666664 | 21.7 |
| 44329.395833333336 | 21.64 |
| 44329.40625 | 20.84 |
| 44329.416666666664 | 21.53 |
| 44329.427083333336 | 21.34 |
| 44329.4375 | 20.27 |
| 44329.447916666664 | 18.15 |
| 44329.458333333336 | 18.17 |
| 44329.46875 | 19.67 |
| 44329.479166666664 | 18.51 |
| 44329.489583333336 | 16.21 |
| 44329.5 | 15.36 |
| 44329.510416666664 | 17.26 |
| 44329.520833333336 | 15.66 |
| 44329.53125 | 14.87 |
| 44329.541666666664 | 15.12 |
| 44329.552083333336 | 36.51 |
| 44329.5625 | 58.35 |
| 44329.572916666664 | 29.79 |
| 44329.583333333336 | 17.94 |
| 44329.59375 | 13.59 |
| 44329.604166666664 | 23.39 |
| 44329.614583333336 | 21.12 |
| 44329.625 | 41.02 |
| 44329.635416666664 | 16.28 |
| 44329.645833333336 | 21.13 |
| 44329.65625 | 55.04 |
| 44329.666666666664 | 17.76 |
| 44329.677083333336 | 16.55 |
| 44329.6875 | 32.26 |
| 44329.697916666664 | 18.42 |
| 44329.708333333336 | 33.65 |
| 44329.71875 | 12.83 |
| 44329.729166666664 | 23.51 |
| 44329.739583333336 | 55.01 |
| 44329.75 | 19.96 |
| 44329.760416666664 | 73.49 |
| 44329.770833333336 | 60.05 |
| 44329.78125 | 55.62 |
| 44329.791666666664 | 20.88 |
| 44329.802083333336 | 38.38 |
| 44329.8125 | 18.72 |
| 44329.822916666664 | 35.21 |
| 44329.833333333336 | 23.21 |
| 44329.84375 | 20.04 |
| 44329.854166666664 | 25.7 |
| 44329.864583333336 | 36.04 |
| 44329.875 | 29.8 |
| 44329.885416666664 | 34.56 |
| 44329.895833333336 | 37.59 |
| 44329.90625 | 36.56 |
| 44329.916666666664 | 41.25 |
| 44329.927083333336 | 35.81 |
| 44329.9375 | 34.23 |
| 44329.947916666664 | 35.32 |
| 44329.958333333336 | 30.87 |
| 44329.96875 | 35.52 |
| 44329.979166666664 | 38.83 |
| 44329.989583333336 | 33.84 |
| 44330.0 | 33.21 |
| 44330.010416666664 | 32.22 |
| 44330.020833333336 | 33.95 |
| 44330.03125 | 34.38 |
| 44330.041666666664 | 32.33 |
| 44330.052083333336 | 30.81 |
| 44330.0625 | 32.96 |
| 44330.072916666664 | 29.15 |
| 44330.083333333336 | 30.07 |
| 44330.09375 | 28.56 |
| 44330.104166666664 | 26.4 |
| 44330.114583333336 | 24.48 |
| 44330.125 | 23.37 |
| 44330.135416666664 | 20.28 |
| 44330.145833333336 | 20.97 |
| 44330.15625 | 20.48 |
| 44330.166666666664 | 19.23 |
| 44330.177083333336 | 18.81 |
| 44330.1875 | 17.63 |
| 44330.197916666664 | 19.83 |
| 44330.208333333336 | 18.37 |
| 44330.21875 | 21.11 |
| 44330.229166666664 | 20.69 |
| 44330.239583333336 | 22.1 |
| 44330.25 | 69.71 |
| 44330.260416666664 | 202.39 |
| 44330.270833333336 | 182.17 |
| 44330.28125 | 166.48 |
| 44330.291666666664 | 185.09 |
| 44330.302083333336 | 116.89 |
| 44330.3125 | 58.46 |
| 44330.322916666664 | 71.49 |
| 44330.333333333336 | 112.45 |
| 44330.34375 | 86.17 |
| 44330.354166666664 | 98.57 |
| 44330.364583333336 | 49.15 |
| 44330.375 | 48.61 |
| 44330.385416666664 | 54.42 |
| 44330.395833333336 | 55.79 |
| 44330.40625 | 51.4 |
| 44330.416666666664 | 45.48 |
| 44330.427083333336 | 46.85 |
| 44330.4375 | 38.33 |
| 44330.447916666664 | 38.13 |
| 44330.458333333336 | 34.98 |
| 44330.46875 | 33.4 |
| 44330.479166666664 | 35.38 |
| 44330.489583333336 | 33.21 |
| 44330.5 | 35.01 |
| 44330.510416666664 | 29.97 |
| 44330.520833333336 | 30.03 |
| 44330.53125 | 29.38 |
| 44330.541666666664 | 27.41 |
| 44330.552083333336 | 26 |
| 44330.5625 | 25.3 |
| 44330.572916666664 | 24.56 |
| 44330.583333333336 | 23.79 |
| 44330.59375 | 23.19 |
| 44330.604166666664 | 23.69 |
| 44330.614583333336 | 23.17 |
| 44330.625 | 26.61 |
| 44330.635416666664 | 26.69 |
| 44330.645833333336 | 20.48 |
| 44330.65625 | 24.8 |
| 44330.666666666664 | 45.2 |
| 44330.677083333336 | 23.56 |
| 44330.6875 | 50.05 |
| 44330.697916666664 | 30.45 |
| 44330.708333333336 | 23.39 |
| 44330.71875 | 32.18 |
| 44330.729166666664 | 34.06 |
| 44330.739583333336 | 56.8 |
| 44330.75 | 32.19 |
| 44330.760416666664 | 57.25 |
| 44330.770833333336 | 142.86 |
| 44330.78125 | 89.18 |
| 44330.791666666664 | 189.06 |
| 44330.802083333336 | 170.41 |
| 44330.8125 | 100.86 |
| 44330.822916666664 | 105.74 |
| 44330.833333333336 | 283.48 |
| 44330.84375 | 219.43 |
| 44330.854166666664 | 161.85 |
| 44330.864583333336 | 130.11 |
| 44330.875 | 107.61 |
| 44330.885416666664 | 91.04 |
| 44330.895833333336 | 87.88 |
| 44330.90625 | 90.01 |
| 44330.916666666664 | 77.4 |
| 44330.927083333336 | 80.91 |
| 44330.9375 | 72.65 |
| 44330.947916666664 | 83.93 |
| 44330.958333333336 | 74.99 |
| 44330.96875 | 72.59 |
| 44330.979166666664 | 62.83 |
| 44330.989583333336 | 59.43 |
| 44331.0 | 56.3 |
| 44331.010416666664 | 67.89 |
| 44331.020833333336 | 58.69 |
| 44331.03125 | 61.93 |
| 44331.041666666664 | 76.61 |
| 44331.052083333336 | 86.71 |
| 44331.0625 | 61.67 |
| 44331.072916666664 | 64.83 |
| 44331.083333333336 | 55.75 |
| 44331.09375 | 81.19 |
| 44331.104166666664 | 53.81 |
| 44331.114583333336 | 52.03 |
| 44331.125 | 47.85 |
| 44331.135416666664 | 42.39 |
| 44331.145833333336 | 40.31 |
| 44331.15625 | 38.99 |
| 44331.166666666664 | 39.48 |
| 44331.177083333336 | 35.49 |
| 44331.1875 | 37.61 |
| 44331.197916666664 | 34.33 |
| 44331.208333333336 | 39.53 |
| 44331.21875 | 41.5 |
| 44331.229166666664 | 44.97 |
| 44331.239583333336 | 44.91 |
| 44331.25 | 46.31 |
| 44331.260416666664 | 195.62 |
| 44331.270833333336 | 206.38 |
| 44331.28125 | 122.47 |
| 44331.291666666664 | 135.03 |
| 44331.302083333336 | 217.97 |
| 44331.3125 | 301.05 |
| 44331.322916666664 | 274.47 |
| 44331.333333333336 | 248.02 |
| 44331.34375 | 251.39 |
| 44331.354166666664 | 309.19 |
| 44331.364583333336 | 215.14 |
| 44331.375 | 140.29 |
| 44331.385416666664 | 193.56 |
| 44331.395833333336 | 100.02 |
| 44331.40625 | 96.39 |
| 44331.416666666664 | 89.45 |
| 44331.427083333336 | 78.45 |
| 44331.4375 | 71.68 |
| 44331.447916666664 | 61.63 |
| 44331.458333333336 | 64.53 |
| 44331.46875 | 55.01 |
| 44331.479166666664 | 62.54 |
| 44331.489583333336 | 49.1 |
| 44331.5 | 57.17 |
| 44331.510416666664 | 36.21 |
| 44331.520833333336 | 42.88 |
| 44331.53125 | 43.46 |
| 44331.541666666664 | 45.59 |
| 44331.552083333336 | 45.85 |
| 44331.5625 | 39.64 |
| 44331.572916666664 | 45.71 |
| 44331.583333333336 | 44.02 |
| 44331.59375 | 47.31 |
| 44331.604166666664 | 49.26 |
| 44331.614583333336 | 46.25 |
| 44331.625 | 48.57 |
| 44331.635416666664 | 47.44 |
| 44331.645833333336 | 49.86 |
| 44331.65625 | 48.84 |
| 44331.666666666664 | 52.53 |
| 44331.677083333336 | 52.46 |
| 44331.6875 | 71.73 |
| 44331.697916666664 | 43.78 |
| 44331.708333333336 | 44.64 |
| 44331.71875 | 40.81 |
| 44331.729166666664 | 45.65 |
| 44331.739583333336 | 32.31 |
| 44331.75 | 35.17 |
| 44331.760416666664 | 38.88 |
| 44331.770833333336 | 32.21 |
| 44331.78125 | 38.73 |
| 44331.791666666664 | 137.31 |
| 44331.802083333336 | 53.83 |
| 44331.8125 | 223.81 |
| 44331.822916666664 | 312.99 |
| 44331.833333333336 | 372.61 |
| 44331.84375 | 252.25 |
| 44331.854166666664 | 436.48 |
| 44331.864583333336 | 340.25 |
| 44331.875 | 375.5 |
| 44331.885416666664 | 182.93 |
| 44331.895833333336 | 222.75 |
| 44331.90625 | 421.81 |
| 44331.916666666664 | 303.56 |
| 44331.927083333336 | 238.24 |
| 44331.9375 | 196.89 |
| 44331.947916666664 | 185.8 |
| 44331.958333333336 | 172.56 |
| 44331.96875 | 146.24 |
| 44331.979166666664 | 127.41 |
| 44331.989583333336 | 136.06 |
| 44332.0 | 116.17 |
| 44332.010416666664 | 101.66 |
| 44332.020833333336 | 111.85 |
| 44332.03125 | 101.19 |
| 44332.041666666664 | 88.76 |
| 44332.052083333336 | 84.06 |
| 44332.0625 | 76.32 |
| 44332.072916666664 | 76.81 |
| 44332.083333333336 | 72.24 |
| 44332.09375 | 71.03 |
| 44332.104166666664 | 69.02 |
| 44332.114583333336 | 69.11 |
| 44332.125 | 63.39 |
| 44332.135416666664 | 86.54 |
| 44332.145833333336 | 80.51 |
| 44332.15625 | 65.1 |
| 44332.166666666664 | 61.04 |
| 44332.177083333336 | 59.01 |
| 44332.1875 | 53.29 |
| 44332.197916666664 | 52.04 |
| 44332.208333333336 | 50.46 |
| 44332.21875 | 53.58 |
| 44332.229166666664 | 102.74 |
| 44332.239583333336 | 153.99 |
| 44332.25 | 141.13 |
| 44332.260416666664 | 81.71 |
| 44332.270833333336 | 194.22 |
| 44332.28125 | 109 |
| 44332.291666666664 | 169.33 |
| 44332.302083333336 | 225.72 |
| 44332.3125 | 250.45 |
| 44332.322916666664 | 307.31 |
| 44332.333333333336 | 267.3 |
| 44332.34375 | 299.72 |
| 44332.354166666664 | 276.7 |
| 44332.364583333336 | 293.27 |
| 44332.375 | 239.76 |
| 44332.385416666664 | 252.22 |
| 44332.395833333336 | 243.98 |
| 44332.40625 | 162.48 |
| 44332.416666666664 | 130.2 |
| 44332.427083333336 | 130.92 |
| 44332.4375 | 92.18 |
| 44332.447916666664 | 97.01 |
| 44332.458333333336 | 69.35 |
| 44332.46875 | 73.17 |
| 44332.479166666664 | 65.25 |
| 44332.489583333336 | 56.14 |
| 44332.5 | 60.79 |
| 44332.510416666664 | 58.4 |
| 44332.520833333336 | 54.92 |
| 44332.53125 | 52.81 |
| 44332.541666666664 | 51.71 |
| 44332.552083333336 | 54.24 |
| 44332.5625 | 68.25 |
| 44332.572916666664 | 46.5 |
| 44332.583333333336 | 72.62 |
| 44332.59375 | 63.58 |
| 44332.604166666664 | 56.97 |
| 44332.614583333336 | 63.27 |
| 44332.625 | 54.31 |
| 44332.635416666664 | 48.12 |
| 44332.645833333336 | 52.37 |
| 44332.65625 | 51.22 |
| 44332.666666666664 | 62.97 |
| 44332.677083333336 | 142.04 |
| 44332.6875 | 58.89 |
| 44332.697916666664 | 76.47 |
| 44332.708333333336 | 98.57 |
| 44332.71875 | 61.94 |
| 44332.729166666664 | 63.75 |
| 44332.739583333336 | 52.66 |
| 44332.75 | 40.26 |
| 44332.760416666664 | 35.81 |
| 44332.770833333336 | 60.4 |
| 44332.78125 | 38.1 |
| 44332.791666666664 | 52.59 |
| 44332.802083333336 | 99.11 |
| 44332.8125 | 115.66 |
| 44332.822916666664 | 154.98 |
| 44332.833333333336 | 278.4 |
| 44332.84375 | 193.05 |
| 44332.854166666664 | 219.37 |
| 44332.864583333336 | 172.91 |
| 44332.875 | 297.43 |
| 44332.885416666664 | 323.37 |
| 44332.895833333336 | 375.48 |
| 44332.90625 | 264.17 |
| 44332.916666666664 | 220.5 |
| 44332.927083333336 | 104.05 |
| 44332.9375 | 178.67 |
| 44332.947916666664 | 166.82 |
| 44332.958333333336 | 121.96 |
| 44332.96875 | 160.72 |
| 44332.979166666664 | 166.3 |
| 44332.989583333336 | 139.16 |
| 44333.0 | 145.21 |
| 44333.010416666664 | 92.2 |
| 44333.020833333336 | 87.23 |
| 44333.03125 | 90.9 |
| 44333.041666666664 | 84.17 |
| 44333.052083333336 | 88.56 |
| 44333.0625 | 66.51 |
| 44333.072916666664 | 83.94 |
| 44333.083333333336 | 64.54 |
| 44333.09375 | 50.16 |
| 44333.104166666664 | 62.04 |
| 44333.114583333336 | 64.75 |
| 44333.125 | 56.41 |
| 44333.135416666664 | 93.03 |
| 44333.145833333336 | 58.31 |
| 44333.15625 | 82.14 |
| 44333.166666666664 | 61.5 |
| 44333.177083333336 | 60.91 |
| 44333.1875 | 57.67 |
| 44333.197916666664 | 51.21 |
| 44333.208333333336 | 52.56 |
| 44333.21875 | 46.96 |
| 44333.229166666664 | 46.86 |
| 44333.239583333336 | 45.67 |
| 44333.25 | 72.46 |
| 44333.260416666664 | 100.63 |
| 44333.270833333336 | 58.7 |
| 44333.28125 | 79.04 |
| 44333.291666666664 | 60.4 |
| 44333.302083333336 | 47.24 |
| 44333.3125 | 48.82 |
| 44333.322916666664 | 58.84 |
| 44333.333333333336 | 70.53 |
| 44333.34375 | 131.23 |
| 44333.354166666664 | 99.36 |
| 44333.364583333336 | 115.01 |
| 44333.375 | 92.42 |
| 44333.385416666664 | 88.46 |
| 44333.395833333336 | 95.41 |
| 44333.40625 | 99.55 |
| 44333.416666666664 | 101.71 |
| 44333.427083333336 | 61.39 |
| 44333.4375 | 119.53 |
| 44333.447916666664 | 121.07 |
| 44333.458333333336 | 107.64 |
| 44333.46875 | 98.1 |
| 44333.479166666664 | 101.07 |
| 44333.489583333336 | 116.43 |
| 44333.5 | 144.83 |
| 44333.510416666664 | 56.55 |
| 44333.520833333336 | 60.22 |
| 44333.53125 | 47.38 |
| 44333.541666666664 | 53.81 |
| 44333.552083333336 | 58.43 |
| 44333.5625 | 40.7 |
| 44333.572916666664 | 35.73 |
| 44333.583333333336 | 27.53 |
| 44333.59375 | 32.45 |
| 44333.604166666664 | 33.49 |
| 44333.614583333336 | 40.5 |
| 44333.625 | 36.24 |
| 44333.635416666664 | 60.47 |
| 44333.645833333336 | 42.46 |
| 44333.65625 | 43.84 |
| 44333.666666666664 | 59.95 |
| 44333.677083333336 | 69.14 |
| 44333.6875 | 43.01 |
| 44333.697916666664 | 34.62 |
| 44333.708333333336 | 49.22 |
| 44333.71875 | 33.52 |
| 44333.729166666664 | 43.21 |
| 44333.739583333336 | 39.01 |
| 44333.75 | 32.85 |
| 44333.760416666664 | 33.96 |
| 44333.770833333336 | 31.32 |
| 44333.78125 | 27.41 |
| 44333.791666666664 | 17.11 |
| 44333.802083333336 | 27.2 |
| 44333.8125 | 25.75 |
| 44333.822916666664 | 29.13 |
| 44333.833333333336 | 32.17 |
| 44333.84375 | 30.77 |
| 44333.854166666664 | 48.97 |
| 44333.864583333336 | 78.18 |
| 44333.875 | 131.23 |
| 44333.885416666664 | 155.47 |
| 44333.895833333336 | 97.24 |
| 44333.90625 | 142.29 |
| 44333.916666666664 | 127.43 |
| 44333.927083333336 | 125.29 |
| 44333.9375 | 80.1 |
| 44333.947916666664 | 161.15 |
| 44333.958333333336 | 72.26 |
| 44333.96875 | 67.8 |
| 44333.979166666664 | 54.43 |
| 44333.989583333336 | 81.2 |
| 44334.0 | 125.32 |
| 44334.010416666664 | 95.24 |
| 44334.020833333336 | 128.55 |
| 44334.03125 | 54.71 |
| 44334.041666666664 | 75.11 |
| 44334.052083333336 | 49.01 |
| 44334.0625 | 89 |
| 44334.072916666664 | 107.05 |
| 44334.083333333336 | 72.59 |
| 44334.09375 | 78.9 |
| 44334.104166666664 | 106.6 |
| 44334.114583333336 | 132.19 |
| 44334.125 | 86.15 |
| 44334.135416666664 | 74.37 |
| 44334.145833333336 | 68.4 |
| 44334.15625 | 40.14 |
| 44334.166666666664 | 39.86 |
| 44334.177083333336 | 46.88 |
| 44334.1875 | 57.46 |
| 44334.197916666664 | 55.73 |
| 44334.208333333336 | 39.26 |
| 44334.21875 | 30.44 |
| 44334.229166666664 | 27.1 |
| 44334.239583333336 | 32.33 |
| 44334.25 | 36.81 |
| 44334.260416666664 | 51.05 |
| 44334.270833333336 | 38.12 |
| 44334.28125 | 28.4 |
| 44334.291666666664 | 35.4 |
| 44334.302083333336 | 62.82 |
| 44334.3125 | 27.25 |
| 44334.322916666664 | 29.87 |
| 44334.333333333336 | 44.08 |
| 44334.34375 | 34.29 |
| 44334.354166666664 | 42.56 |
| 44334.364583333336 | 30.87 |
| 44334.375 | 32.97 |
| 44334.385416666664 | 37.92 |
| 44334.395833333336 | 52.01 |
| 44334.40625 | 52.12 |
| 44334.416666666664 | 65.42 |
| 44334.427083333336 | 86.88 |
| 44334.4375 | 52.61 |
| 44334.447916666664 | 85.52 |
| 44334.458333333336 | 73.84 |
| 44334.46875 | 71.98 |
| 44334.479166666664 | 68.6 |
| 44334.489583333336 | 39.16 |
| 44334.5 | 43.95 |
| 44334.510416666664 | 40.93 |
| 44334.520833333336 | 30.7 |
| 44334.53125 | 43.07 |
| 44334.541666666664 | 77.37 |
| 44334.552083333336 | 5 |
| 44334.5625 | 4.51 |
| 44334.572916666664 | 4.26 |
| 44334.583333333336 | 4.43 |
| 44334.59375 | 4.38 |
| 44334.604166666664 | 3.82 |
| 44334.614583333336 | 3.71 |
| 44334.625 | 3.62 |
| 44334.635416666664 | 3.4 |
| 44334.645833333336 | 4.08 |
| 44334.65625 | 3.84 |
| 44334.666666666664 | 3.21 |
| 44334.677083333336 | 3.37 |
| 44334.6875 | 3.29 |
| 44334.697916666664 | 2.89 |
| 44334.708333333336 | 3.53 |
| 44334.71875 | 3.7 |
| 44334.729166666664 | 3.93 |
| 44334.739583333336 | 5.27 |
| 44334.75 | 3.82 |
| 44334.760416666664 | 4.63 |
| 44334.770833333336 | 4.2 |
| 44334.78125 | 3.37 |
| 44334.791666666664 | 3.39 |
| 44334.802083333336 | 3.83 |
| 44334.8125 | 3.75 |
| 44334.822916666664 | 3.95 |
| 44334.833333333336 | 4.36 |
| 44334.84375 | 3.78 |
| 44334.854166666664 | 3.78 |
| 44334.864583333336 | 4.84 |
| 44334.875 | 5.29 |
| 44334.885416666664 | 5.7 |
| 44334.895833333336 | 5.37 |
| 44334.90625 | 5.95 |
| 44334.916666666664 | 6.03 |
| 44334.927083333336 | 6.54 |
| 44334.9375 | 6.78 |
| 44334.947916666664 | 6.57 |
| 44334.958333333336 | 6.34 |
| 44334.96875 | 5.89 |
| 44334.979166666664 | 5.99 |
| 44334.989583333336 | 6.06 |
| 44335.0 | 7.5 |
| 44335.010416666664 | 6.85 |
| 44335.020833333336 | 7.15 |
| 44335.03125 | 8.1 |
| 44335.041666666664 | 7 |
| 44335.052083333336 | 5.85 |
| 44335.0625 | 5.66 |
| 44335.072916666664 | 5.12 |
| 44335.083333333336 | 5.99 |
| 44335.09375 | 6.31 |
| 44335.104166666664 | 6.13 |
| 44335.114583333336 | 6.85 |
| 44335.125 | 6.4 |
| 44335.135416666664 | 6.34 |
| 44335.145833333336 | 5.86 |
| 44335.15625 | 5.9 |
| 44335.166666666664 | 5.83 |
| 44335.177083333336 | 5.72 |
| 44335.1875 | 4.99 |
| 44335.197916666664 | 5.04 |
| 44335.208333333336 | 5.07 |
| 44335.21875 | 5.27 |
| 44335.229166666664 | 4.45 |
| 44335.239583333336 | 5.35 |
| 44335.25 | 5.43 |
| 44335.260416666664 | 5.36 |
| 44335.270833333336 | 4.77 |
| 44335.28125 | 4.43 |
| 44335.291666666664 | 4.84 |
| 44335.302083333336 | 4.47 |
| 44335.3125 | 3.83 |
| 44335.322916666664 | 3.39 |
| 44335.333333333336 | 3.48 |
| 44335.34375 | 3.99 |
| 44335.354166666664 | 3.49 |
| 44335.364583333336 | 4.75 |
| 44335.375 | 4.07 |
| 44335.385416666664 | 4.37 |
| 44335.395833333336 | 5.35 |
| 44335.40625 | 5.75 |
| 44335.416666666664 | 5.3 |
| 44335.427083333336 | 4.84 |
| 44335.4375 | 5.06 |
| 44335.447916666664 | 5.28 |
| 44335.458333333336 | 5.64 |
| 44335.46875 | 5.75 |
| 44335.479166666664 | 5.92 |
| 44335.489583333336 | 6.53 |
| 44335.5 | 38.48 |
| 44335.510416666664 | 8.01 |
| 44335.520833333336 | 60.05 |
| 44335.53125 | 7.72 |
| 44335.541666666664 | 7.18 |
| 44335.552083333336 | 8.64 |
| 44335.5625 | 7.7 |
| 44335.572916666664 | 6.42 |
| 44335.583333333336 | 6.69 |
| 44335.59375 | 6.37 |
| 44335.604166666664 | 5.8 |
| 44335.614583333336 | 6.07 |
| 44335.625 | 5.29 |
| 44335.635416666664 | 5.88 |
| 44335.645833333336 | 5.75 |
| 44335.65625 | 5.39 |
| 44335.666666666664 | 5.02 |
| 44335.677083333336 | 4.92 |
| 44335.6875 | 4.17 |
| 44335.697916666664 | 4.24 |
| 44335.708333333336 | 3.95 |
| 44335.71875 | 4.15 |
| 44335.729166666664 | 4 |
| 44335.739583333336 | 3.68 |
| 44335.75 | 3.8 |
| 44335.760416666664 | 4.48 |
| 44335.770833333336 | 4.45 |
| 44335.78125 | 4.67 |
| 44335.791666666664 | 4.19 |
| 44335.802083333336 | 5.73 |
| 44335.8125 | 5.05 |
| 44335.822916666664 | 4.9 |
| 44335.833333333336 | 4.26 |
| 44335.84375 | 5.59 |
| 44335.854166666664 | 6.4 |
| 44335.864583333336 | 5.94 |
| 44335.875 | 5.45 |
| 44335.885416666664 | 5.79 |
| 44335.895833333336 | 5.23 |
| 44335.90625 | 5.6 |
| 44335.916666666664 | 5.88 |
| 44335.927083333336 | 6.65 |
| 44335.9375 | 7.04 |
| 44335.947916666664 | 7.53 |
| 44335.958333333336 | 7.64 |
| 44335.96875 | 7.88 |
| 44335.979166666664 | 8.17 |
| 44335.989583333336 | 7.91 |
| 44336.0 | 8.21 |
| 44336.010416666664 | 8.01 |
| 44336.020833333336 | 8.47 |
| 44336.03125 | 10.48 |
| 44336.041666666664 | 10.78 |
| 44336.052083333336 | 11.02 |
| 44336.0625 | 9.53 |
| 44336.072916666664 | 8.64 |
| 44336.083333333336 | 8.15 |
| 44336.09375 | 7.5 |
| 44336.104166666664 | 6.76 |
| 44336.114583333336 | 7.16 |
| 44336.125 | 6.75 |
| 44336.135416666664 | 6.68 |
| 44336.145833333336 | 6.52 |
| 44336.15625 | 6.32 |
| 44336.166666666664 | 5.43 |
| 44336.177083333336 | 5.22 |
| 44336.1875 | 5.64 |
| 44336.197916666664 | 5.18 |
| 44336.208333333336 | 5.17 |
| 44336.21875 | 5.12 |
| 44336.229166666664 | 4.87 |
| 44336.239583333336 | 4.7 |
| 44336.25 | 5.26 |
| 44336.260416666664 | 5.01 |
| 44336.270833333336 | 5.31 |
| 44336.28125 | 4.87 |
| 44336.291666666664 | 5.23 |
| 44336.302083333336 | 5.6 |
| 44336.3125 | 6.28 |
| 44336.322916666664 | 5.05 |
| 44336.333333333336 | 4.28 |
| 44336.34375 | 3.95 |
| 44336.354166666664 | 4.36 |
| 44336.364583333336 | 3.72 |
| 44336.375 | 3.66 |
| 44336.385416666664 | 3.72 |
| 44336.395833333336 | 3.72 |
| 44336.40625 | 3.8 |
| 44336.416666666664 | 4.04 |
| 44336.427083333336 | 4.14 |
| 44336.4375 | 4.19 |
| 44336.447916666664 | 4.71 |
| 44336.458333333336 | 4.94 |
| 44336.46875 | 5.03 |
| 44336.479166666664 | 5.73 |
| 44336.489583333336 | 5.73 |
| 44336.5 | 6.27 |
| 44336.510416666664 | 6.31 |
| 44336.520833333336 | 6.37 |
| 44336.53125 | 6.52 |
| 44336.541666666664 | 6.88 |
| 44336.552083333336 | 7.27 |
| 44336.5625 | 8.14 |
| 44336.572916666664 | 8.01 |
| 44336.583333333336 | 8.45 |
| 44336.59375 | 8.56 |
| 44336.604166666664 | 7.9 |
| 44336.614583333336 | 6.87 |
| 44336.625 | 6.35 |
| 44336.635416666664 | 6.38 |
| 44336.645833333336 | 5.63 |
| 44336.65625 | 5.31 |
| 44336.666666666664 | 6.33 |
| 44336.677083333336 | 5.54 |
| 44336.6875 | 5.89 |
| 44336.697916666664 | 5.77 |
| 44336.708333333336 | 6.16 |
| 44336.71875 | 5.59 |
| 44336.729166666664 | 5.88 |
| 44336.739583333336 | 5.64 |
| 44336.75 | 6.18 |
| 44336.760416666664 | 6.42 |
| 44336.770833333336 | 6.56 |
| 44336.78125 | 6.53 |
| 44336.791666666664 | 6.78 |
| 44336.802083333336 | 6.8 |
| 44336.8125 | 6.79 |
| 44336.822916666664 | 6.81 |
| 44336.833333333336 | 6.99 |
| 44336.84375 | 7.47 |
| 44336.854166666664 | 7.94 |
| 44336.864583333336 | 7.38 |
| 44336.875 | 6.42 |
| 44336.885416666664 | 6.55 |
| 44336.895833333336 | 6.89 |
| 44336.90625 | 6.15 |
| 44336.916666666664 | 6.07 |
| 44336.927083333336 | 5.75 |
| 44336.9375 | 5.77 |
| 44336.947916666664 | 5.9 |
| 44336.958333333336 | 7.3 |
| 44336.96875 | 7.5 |
| 44336.979166666664 | 7.83 |
| 44336.989583333336 | 7.96 |
| 44337.0 | 8.08 |
| 44337.010416666664 | 8.39 |
| 44337.020833333336 | 8.91 |
| 44337.03125 | 9.14 |
| 44337.041666666664 | 9.71 |
| 44337.052083333336 | 10.04 |
| 44337.0625 | 9.96 |
| 44337.072916666664 | 10.58 |
| 44337.083333333336 | 10.49 |
| 44337.09375 | 10.84 |
| 44337.104166666664 | 11.72 |
| 44337.114583333336 | 11 |
| 44337.125 | 11.08 |
| 44337.135416666664 | 10.33 |
| 44337.145833333336 | 9.55 |
| 44337.15625 | 8.92 |
| 44337.166666666664 | 8.79 |
| 44337.177083333336 | 8.85 |
| 44337.1875 | 7.8 |
| 44337.197916666664 | 7.59 |
| 44337.208333333336 | 7.04 |
| 44337.21875 | 6.77 |
| 44337.229166666664 | 7.52 |
| 44337.239583333336 | 7.41 |
| 44337.25 | 7.7 |
| 44337.260416666664 | 6.99 |
| 44337.270833333336 | 7.32 |
| 44337.28125 | 7.6 |
| 44337.291666666664 | 6.94 |
| 44337.302083333336 | 7.41 |
| 44337.3125 | 7.07 |
| 44337.322916666664 | 6.42 |
| 44337.333333333336 | 6.46 |
| 44337.34375 | 6.21 |
| 44337.354166666664 | 6.07 |
| 44337.364583333336 | 5.15 |
| 44337.375 | 6.67 |
| 44337.385416666664 | 6.93 |
| 44337.395833333336 | 5.26 |
| 44337.40625 | 5.19 |
| 44337.416666666664 | 4.51 |
| 44337.427083333336 | 4.35 |
| 44337.4375 | 4.5 |
| 44337.447916666664 | 4.36 |
| 44337.458333333336 | 4.59 |
| 44337.46875 | 5.07 |
| 44337.479166666664 | 5.31 |
| 44337.489583333336 | 6.63 |
| 44337.5 | 7.62 |
| 44337.510416666664 | 24.07 |
| 44337.520833333336 | 7.06 |
| 44337.53125 | 7.53 |
| 44337.541666666664 | 7.59 |
| 44337.552083333336 | 7.88 |
| 44337.5625 | 8.18 |
| 44337.572916666664 | 8.49 |
| 44337.583333333336 | 8.52 |
| 44337.59375 | 9.12 |
| 44337.604166666664 | 9.88 |
| 44337.614583333336 | 9.46 |
| 44337.625 | 10.71 |
| 44337.635416666664 | 11 |
| 44337.645833333336 | 10.56 |
| 44337.65625 | 8.68 |
| 44337.666666666664 | 8.7 |
| 44337.677083333336 | 7.92 |
| 44337.6875 | 7.73 |
| 44337.697916666664 | 6.62 |
| 44337.708333333336 | 7.36 |
| 44337.71875 | 7.94 |
| 44337.729166666664 | 6.59 |
| 44337.739583333336 | 6.68 |
| 44337.75 | 6.74 |
| 44337.760416666664 | 6.71 |
| 44337.770833333336 | 6.75 |
| 44337.78125 | 6.38 |
| 44337.791666666664 | 6.16 |
| 44337.802083333336 | 6.69 |
| 44337.8125 | 6.8 |
| 44337.822916666664 | 6.78 |
| 44337.833333333336 | 7.07 |
| 44337.84375 | 7.31 |
| 44337.854166666664 | 7.77 |
| 44337.864583333336 | 7.87 |
| 44337.875 | 8.07 |
| 44337.885416666664 | 7.74 |
| 44337.895833333336 | 10.3 |
| 44337.90625 | 6.65 |
| 44337.916666666664 | 6.18 |
| 44337.927083333336 | 6.29 |
| 44337.9375 | 6.79 |
| 44337.947916666664 | 6.16 |
| 44337.958333333336 | 6.07 |
| 44337.96875 | 5.74 |
| 44337.979166666664 | 6.43 |
| 44337.989583333336 | 6.07 |
| 44338.0 | 6.04 |
| 44338.010416666664 | 7.81 |
| 44338.020833333336 | 9.34 |
| 44338.03125 | 9.88 |
| 44338.041666666664 | 10.42 |
| 44338.052083333336 | 9.76 |
| 44338.0625 | 11.63 |
| 44338.072916666664 | 12.15 |
| 44338.083333333336 | 11.71 |
| 44338.09375 | 13.47 |
| 44338.104166666664 | 13.68 |
| 44338.114583333336 | 14.22 |
| 44338.125 | 15.34 |
| 44338.135416666664 | 19.06 |
| 44338.145833333336 | 17.26 |
| 44338.15625 | 13.64 |
| 44338.166666666664 | 16.95 |
| 44338.177083333336 | 15.12 |
| 44338.1875 | 11.67 |
| 44338.197916666664 | 12.03 |
| 44338.208333333336 | 10.99 |
| 44338.21875 | 10.12 |
| 44338.229166666664 | 9.06 |
| 44338.239583333336 | 8.55 |
| 44338.25 | 8.19 |
| 44338.260416666664 | 6.86 |
| 44338.270833333336 | 7.01 |
| 44338.28125 | 6.59 |
| 44338.291666666664 | 6.97 |
| 44338.302083333336 | 5.74 |
| 44338.3125 | 6.03 |
| 44338.322916666664 | 5.6 |
| 44338.333333333336 | 5.67 |
| 44338.34375 | 6.09 |
| 44338.354166666664 | 5.54 |
| 44338.364583333336 | 5.85 |
| 44338.375 | 5.77 |
| 44338.385416666664 | 5.87 |
| 44338.395833333336 | 5.51 |
| 44338.40625 | 8.59 |
| 44338.416666666664 | 5.78 |
| 44338.427083333336 | 5.53 |
| 44338.4375 | 4.23 |
| 44338.447916666664 | 4.04 |
| 44338.458333333336 | 4.2 |
| 44338.46875 | 4.65 |
| 44338.479166666664 | 4.97 |
| 44338.489583333336 | 5.27 |
| 44338.5 | 5.13 |
| 44338.510416666664 | 6.36 |
| 44338.520833333336 | 6.39 |
| 44338.53125 | 7.27 |
| 44338.541666666664 | 7.39 |
| 44338.552083333336 | 8.79 |
| 44338.5625 | 8.86 |
| 44338.572916666664 | 9.4 |
| 44338.583333333336 | 10.17 |
| 44338.59375 | 10.42 |
| 44338.604166666664 | 12.28 |
| 44338.614583333336 | 11.98 |
| 44338.625 | 13 |
| 44338.635416666664 | 13.56 |
| 44338.645833333336 | 13.95 |
| 44338.65625 | 17.89 |
| 44338.666666666664 | 14.97 |
| 44338.677083333336 | 14.73 |
| 44338.6875 | 12.05 |
| 44338.697916666664 | 12.01 |
| 44338.708333333336 | 11.2 |
| 44338.71875 | 10.27 |
| 44338.729166666664 | 10.39 |
| 44338.739583333336 | 10.12 |
| 44338.75 | 8.89 |
| 44338.760416666664 | 7.78 |
| 44338.770833333336 | 7.74 |
| 44338.78125 | 6.28 |
| 44338.791666666664 | 5.79 |
| 44338.802083333336 | 5.62 |
| 44338.8125 | 6.03 |
| 44338.822916666664 | 6.27 |
| 44338.833333333336 | 6.71 |
| 44338.84375 | 6.67 |
| 44338.854166666664 | 6.75 |
| 44338.864583333336 | 6.47 |
| 44338.875 | 6.46 |
| 44338.885416666664 | 6.51 |
| 44338.895833333336 | 6.09 |
| 44338.90625 | 6.21 |
| 44338.916666666664 | 6.15 |
| 44338.927083333336 | 6.31 |
| 44338.9375 | 6.23 |
| 44338.947916666664 | 6.4 |
| 44338.958333333336 | 6.92 |
| 44338.96875 | 6.21 |
| 44338.979166666664 | 6.64 |
| 44338.989583333336 | 6.87 |
| 44339.0 | 7.13 |
| 44339.010416666664 | 7.92 |
| 44339.020833333336 | 7.24 |
| 44339.03125 | 7.56 |
| 44339.041666666664 | 7.69 |
| 44339.052083333336 | 6.75 |
| 44339.0625 | 7.5 |
| 44339.072916666664 | 8.93 |
| 44339.083333333336 | 9.45 |
| 44339.09375 | 11.96 |
| 44339.104166666664 | 12.91 |
| 44339.114583333336 | 13.68 |
| 44339.125 | 13.68 |
| 44339.135416666664 | 14.99 |
| 44339.145833333336 | 14.68 |
| 44339.15625 | 16.07 |
| 44339.166666666664 | 17.43 |
| 44339.177083333336 | 21.46 |
| 44339.1875 | 17.1 |
| 44339.197916666664 | 14.39 |
| 44339.208333333336 | 16.54 |
| 44339.21875 | 14.4 |
| 44339.229166666664 | 13.19 |
| 44339.239583333336 | 12.62 |
| 44339.25 | 10.74 |
| 44339.260416666664 | 10.3 |
| 44339.270833333336 | 9.55 |
| 44339.28125 | 8.15 |
| 44339.291666666664 | 7.86 |
| 44339.302083333336 | 7.15 |
| 44339.3125 | 7.17 |
| 44339.322916666664 | 5.96 |
| 44339.333333333336 | 5.58 |
| 44339.34375 | 6.09 |
| 44339.354166666664 | 5.55 |
| 44339.364583333336 | 5.74 |
| 44339.375 | 5.86 |
| 44339.385416666664 | 5.55 |
| 44339.395833333336 | 6.47 |
| 44339.40625 | 6.18 |
| 44339.416666666664 | 6.28 |
| 44339.427083333336 | 5.45 |
| 44339.4375 | 4.94 |
| 44339.447916666664 | 4.44 |
| 44339.458333333336 | 5.04 |
| 44339.46875 | 4.74 |
| 44339.479166666664 | 4.35 |
| 44339.489583333336 | 4.25 |
| 44339.5 | 4.24 |
| 44339.510416666664 | 4.08 |
| 44339.520833333336 | 4.27 |
| 44339.53125 | 4.59 |
| 44339.541666666664 | 3.89 |
| 44339.552083333336 | 4.64 |
| 44339.5625 | 5.27 |
| 44339.572916666664 | 6.05 |
| 44339.583333333336 | 5.53 |
| 44339.59375 | 5.71 |
| 44339.604166666664 | 7.66 |
| 44339.614583333336 | 8.02 |
| 44339.625 | 9.48 |
| 44339.635416666664 | 10.68 |
| 44339.645833333336 | 11.33 |
| 44339.65625 | 12.53 |
| 44339.666666666664 | 13.22 |
| 44339.677083333336 | 15.41 |
| 44339.6875 | 16.52 |
| 44339.697916666664 | 12.81 |
| 44339.708333333336 | 13.95 |
| 44339.71875 | 15.2 |
| 44339.729166666664 | 12.06 |
| 44339.739583333336 | 12.85 |
| 44339.75 | 11.7 |
| 44339.760416666664 | 10.44 |
| 44339.770833333336 | 10.89 |
| 44339.78125 | 9.74 |
| 44339.791666666664 | 8.89 |
| 44339.802083333336 | 8.05 |
| 44339.8125 | 6.91 |
| 44339.822916666664 | 6.82 |
| 44339.833333333336 | 7.3 |
| 44339.84375 | 7.27 |
| 44339.854166666664 | 7.27 |
| 44339.864583333336 | 7.39 |
| 44339.875 | 7.02 |
| 44339.885416666664 | 7.03 |
| 44339.895833333336 | 7.56 |
| 44339.90625 | 7.61 |
| 44339.916666666664 | 7.21 |
| 44339.927083333336 | 7.37 |
| 44339.9375 | 7.88 |
| 44339.947916666664 | 8.16 |
| 44339.958333333336 | 8 |
| 44339.96875 | 7.31 |
| 44339.979166666664 | 7.83 |
| 44339.989583333336 | 7.48 |
| 44340.0 | 7.1 |
| 44340.010416666664 | 7.09 |
| 44340.020833333336 | 7.58 |
| 44340.03125 | 9.54 |
| 44340.041666666664 | 8.11 |
| 44340.052083333336 | 8 |
| 44340.0625 | 7.49 |
| 44340.072916666664 | 7.76 |
| 44340.083333333336 | 7.48 |
| 44340.09375 | 8.45 |
| 44340.104166666664 | 7.56 |
| 44340.114583333336 | 8.02 |
| 44340.125 | 9.88 |
| 44340.135416666664 | 10.14 |
| 44340.145833333336 | 9.66 |
| 44340.15625 | 13.04 |
| 44340.166666666664 | 14.03 |
| 44340.177083333336 | 14.75 |
| 44340.1875 | 15.2 |
| 44340.197916666664 | 15.88 |
| 44340.208333333336 | 15.99 |
| 44340.21875 | 17.56 |
| 44340.229166666664 | 20.7 |
| 44340.239583333336 | 15.56 |
| 44340.25 | 14.21 |
| 44340.260416666664 | 14.68 |
| 44340.270833333336 | 13.86 |
| 44340.28125 | 12.63 |
| 44340.291666666664 | 11.27 |
| 44340.302083333336 | 10.96 |
| 44340.3125 | 9.75 |
| 44340.322916666664 | 8.76 |
| 44340.333333333336 | 7.98 |
| 44340.34375 | 7.92 |
| 44340.354166666664 | 7.35 |
| 44340.364583333336 | 7.38 |
| 44340.375 | 6.92 |
| 44340.385416666664 | 7.06 |
| 44340.395833333336 | 6.71 |
| 44340.40625 | 6.74 |
| 44340.416666666664 | 5.99 |
| 44340.427083333336 | 5.98 |
| 44340.4375 | 5.65 |
| 44340.447916666664 | 5.41 |
| 44340.458333333336 | 5 |
| 44340.46875 | 5.56 |
| 44340.479166666664 | 5.15 |
| 44340.489583333336 | 5.08 |
| 44340.5 | 5.21 |
| 44340.510416666664 | 4.89 |
| 44340.520833333336 | 4.89 |
| 44340.53125 | 5.25 |
| 44340.541666666664 | 5.63 |
| 44340.552083333336 | 5.72 |
| 44340.5625 | 5.53 |
| 44340.572916666664 | 5.71 |
| 44340.583333333336 | 5.95 |
| 44340.59375 | 6.28 |
| 44340.604166666664 | 7.4 |
| 44340.614583333336 | 7.14 |
| 44340.625 | 7.76 |
| 44340.635416666664 | 8.54 |
| 44340.645833333336 | 10.22 |
| 44340.65625 | 11.13 |
| 44340.666666666664 | 11.48 |
| 44340.677083333336 | 11.68 |
| 44340.6875 | 12.2 |
| 44340.697916666664 | 15.19 |
| 44340.708333333336 | 17.28 |
| 44340.71875 | 18.6 |
| 44340.729166666664 | 19.48 |
| 44340.739583333336 | 20.18 |
| 44340.75 | 19.36 |
| 44340.760416666664 | 17.18 |
| 44340.770833333336 | 18.05 |
| 44340.78125 | 18.64 |
| 44340.791666666664 | 17.44 |
| 44340.802083333336 | 16.88 |
| 44340.8125 | 15.78 |
| 44340.822916666664 | 14.97 |
| 44340.833333333336 | 14.5 |
| 44340.84375 | 13.47 |
| 44340.854166666664 | 13.25 |
| 44340.864583333336 | 11.73 |
| 44340.875 | 11.51 |
| 44340.885416666664 | 10.85 |
| 44340.895833333336 | 10.34 |
| 44340.90625 | 9.81 |
| 44340.916666666664 | 9.25 |
| 44340.927083333336 | 8.5 |
| 44340.9375 | 8.18 |
| 44340.947916666664 | 7.89 |
| 44340.958333333336 | 8.08 |
| 44340.96875 | 7.46 |
| 44340.979166666664 | 7.67 |
| 44340.989583333336 | 6.81 |
| 44341.0 | 7.46 |
| 44341.010416666664 | 7.75 |
| 44341.020833333336 | 8.05 |
| 44341.03125 | 7.64 |
| 44341.041666666664 | 7.56 |
| 44341.052083333336 | 7.51 |
| 44341.0625 | 7.83 |
| 44341.072916666664 | 7.79 |
| 44341.083333333336 | 7.54 |
| 44341.09375 | 7.75 |
| 44341.104166666664 | 7.88 |
| 44341.114583333336 | 7.86 |
| 44341.125 | 7.57 |
| 44341.135416666664 | 7.76 |
| 44341.145833333336 | 8.21 |
| 44341.15625 | 8.15 |
| 44341.166666666664 | 8.99 |
| 44341.177083333336 | 9.63 |
| 44341.1875 | 11.2 |
| 44341.197916666664 | 11.6 |
| 44341.208333333336 | 11.66 |
| 44341.21875 | 10.51 |
| 44341.229166666664 | 11.71 |
| 44341.239583333336 | 11.78 |
| 44341.25 | 11.96 |
| 44341.260416666664 | 11.51 |
| 44341.270833333336 | 11.49 |
| 44341.28125 | 11.09 |
| 44341.291666666664 | 11.05 |
| 44341.302083333336 | 10.89 |
| 44341.3125 | 10.63 |
| 44341.322916666664 | 10.7 |
| 44341.333333333336 | 10.07 |
| 44341.34375 | 9.58 |
| 44341.354166666664 | 8.51 |
| 44341.364583333336 | 8.63 |
| 44341.375 | 8.52 |
| 44341.385416666664 | 8.41 |
| 44341.395833333336 | 8.25 |
| 44341.40625 | 7.96 |
| 44341.416666666664 | 7.81 |
| 44341.427083333336 | 7.25 |
| 44341.4375 | 6.84 |
| 44341.447916666664 | 6.59 |
| 44341.458333333336 | 6.38 |
| 44341.46875 | 5.93 |
| 44341.479166666664 | 5.48 |
| 44341.489583333336 | 5.49 |
| 44341.5 | 5.46 |
| 44341.510416666664 | 5.54 |
| 44341.520833333336 | 5.2 |
| 44341.53125 | 5.58 |
| 44341.541666666664 | 5.18 |
| 44341.552083333336 | 5.32 |
| 44341.5625 | 5.49 |
| 44341.572916666664 | 5.33 |
| 44341.583333333336 | 5.77 |
| 44341.59375 | 5.41 |
| 44341.604166666664 | 5.93 |
| 44341.614583333336 | 5.8 |
| 44341.625 | 5.97 |
| 44341.635416666664 | 6.54 |
| 44341.645833333336 | 6.61 |
| 44341.65625 | 6.62 |
| 44341.666666666664 | 7.38 |
| 44341.677083333336 | 7.71 |
| 44341.6875 | 7.44 |
| 44341.697916666664 | 8.06 |
| 44341.708333333336 | 8.69 |
| 44341.71875 | 9.26 |
| 44341.729166666664 | 10.67 |
| 44341.739583333336 | 11.22 |
| 44341.75 | 12.31 |
| 44341.760416666664 | 13.15 |
| 44341.770833333336 | 14.36 |
| 44341.78125 | 15.53 |
| 44341.791666666664 | 11.81 |
| 44341.802083333336 | 13.75 |
| 44341.8125 | 14.54 |
| 44341.822916666664 | 11.78 |
| 44341.833333333336 | 10.33 |
| 44341.84375 | 10 |
| 44341.854166666664 | 8.88 |
| 44341.864583333336 | 7.89 |
| 44341.875 | 6.95 |
| 44341.885416666664 | 6.64 |
| 44341.895833333336 | 6.19 |
| 44341.90625 | 6.05 |
| 44341.916666666664 | 6.04 |
| 44341.927083333336 | 6.45 |
| 44341.9375 | 6.56 |
| 44341.947916666664 | 6.99 |
| 44341.958333333336 | 6.91 |
| 44341.96875 | 6.7 |
| 44341.979166666664 | 6.71 |
| 44341.989583333336 | 6.57 |
| 44342.0 | 6.71 |
| 44342.010416666664 | 7.38 |
| 44342.020833333336 | 8.12 |
| 44342.03125 | 7.81 |
| 44342.041666666664 | 7.42 |
| 44342.052083333336 | 7.16 |
| 44342.0625 | 7.19 |
| 44342.072916666664 | 6.17 |
| 44342.083333333336 | 6.25 |
| 44342.09375 | 5.78 |
| 44342.104166666664 | 5.29 |
| 44342.114583333336 | 5.14 |
| 44342.125 | 4.87 |
| 44342.135416666664 | 5 |
| 44342.145833333336 | 5.02 |
| 44342.15625 | 4.69 |
| 44342.166666666664 | 5.03 |
| 44342.177083333336 | 5.47 |
| 44342.1875 | 5.27 |
| 44342.197916666664 | 5.43 |
| 44342.208333333336 | 6.1 |
| 44342.21875 | 5.7 |
| 44342.229166666664 | 5.28 |
| 44342.239583333336 | 5.69 |
| 44342.25 | 6.24 |
| 44342.260416666664 | 6.28 |
| 44342.270833333336 | 7.04 |
| 44342.28125 | 7.27 |
| 44342.291666666664 | 7.23 |
| 44342.302083333336 | 7.23 |
| 44342.3125 | 7.27 |
| 44342.322916666664 | 7.27 |
| 44342.333333333336 | 5.99 |
| 44342.34375 | 6.24 |
| 44342.354166666664 | 6.31 |
| 44342.364583333336 | 6.23 |
| 44342.375 | 6.24 |
| 44342.385416666664 | 6.61 |
| 44342.395833333336 | 6.38 |
| 44342.40625 | 5.98 |
| 44342.416666666664 | 5.77 |
| 44342.427083333336 | 5.93 |
| 44342.4375 | 5.8 |
| 44342.447916666664 | 5.67 |
| 44342.458333333336 | 5.79 |
| 44342.46875 | 6.13 |
| 44342.479166666664 | 5.85 |
| 44342.489583333336 | 5.65 |
| 44342.5 | 5.54 |
| 44342.510416666664 | 5.39 |
| 44342.520833333336 | 5.57 |
| 44342.53125 | 5.73 |
| 44342.541666666664 | 5.19 |
| 44342.552083333336 | 5.18 |
| 44342.5625 | 4.86 |
| 44342.572916666664 | 4.88 |
| 44342.583333333336 | 4.85 |
| 44342.59375 | 4.92 |
| 44342.604166666664 | 4.23 |
| 44342.614583333336 | 4.33 |
| 44342.625 | 4.3 |
| 44342.635416666664 | 3.75 |
| 44342.645833333336 | 4.06 |
| 44342.65625 | 4.47 |
| 44342.666666666664 | 5.03 |
| 44342.677083333336 | 5.48 |
| 44342.6875 | 5.55 |
| 44342.697916666664 | 6.07 |
| 44342.708333333336 | 6.52 |
| 44342.71875 | 6.39 |
| 44342.729166666664 | 7.88 |
| 44342.739583333336 | 8.72 |
| 44342.75 | 10.05 |
| 44342.760416666664 | 11.55 |
| 44342.770833333336 | 13.24 |
| 44342.78125 | 13.92 |
| 44342.791666666664 | 15.29 |
| 44342.802083333336 | 14.24 |
| 44342.8125 | 22.78 |
| 44342.822916666664 | 13.28 |
| 44342.833333333336 | 12.53 |
| 44342.84375 | 12.89 |
| 44342.854166666664 | 10.92 |
| 44342.864583333336 | 9.16 |
| 44342.875 | 8.2 |
| 44342.885416666664 | 7.71 |
| 44342.895833333336 | 8.38 |
| 44342.90625 | 9.02 |
| 44342.916666666664 | 9.42 |
| 44342.927083333336 | 9.66 |
| 44342.9375 | 9.81 |
| 44342.947916666664 | 9.48 |
| 44342.958333333336 | 8.8 |
| 44342.96875 | 8.46 |
| 44342.979166666664 | 8.12 |
| 44342.989583333336 | 7.6 |
| 44343.0 | 7.42 |
| 44343.010416666664 | 7.67 |
| 44343.020833333336 | 7.25 |
| 44343.03125 | 7.35 |
| 44343.041666666664 | 6.86 |
| 44343.052083333336 | 6.68 |
| 44343.0625 | 8.67 |
| 44343.072916666664 | 7.14 |
| 44343.083333333336 | 6.99 |
| 44343.09375 | 5.62 |
| 44343.104166666664 | 5.53 |
| 44343.114583333336 | 5.58 |
| 44343.125 | 5.22 |
| 44343.135416666664 | 5.11 |
| 44343.145833333336 | 4.95 |
| 44343.15625 | 4.49 |
| 44343.166666666664 | 4.78 |
| 44343.177083333336 | 4.38 |
| 44343.1875 | 4.57 |
| 44343.197916666664 | 4.44 |
| 44343.208333333336 | 5.31 |
| 44343.21875 | 5.74 |
| 44343.229166666664 | 6.13 |
| 44343.239583333336 | 6.42 |
| 44343.25 | 6.68 |
| 44343.260416666664 | 6.79 |
| 44343.270833333336 | 6.34 |
| 44343.28125 | 6.45 |
| 44343.291666666664 | 7.26 |
| 44343.302083333336 | 7.29 |
| 44343.3125 | 7.37 |
| 44343.322916666664 | 7.24 |
| 44343.333333333336 | 7.17 |
| 44343.34375 | 7.34 |
| 44343.354166666664 | 7.1 |
| 44343.364583333336 | 6.53 |
| 44343.375 | 6.3 |
| 44343.385416666664 | 6.22 |
| 44343.395833333336 | 6.29 |
| 44343.40625 | 6.41 |
| 44343.416666666664 | 7.27 |
| 44343.427083333336 | 7.15 |
| 44343.4375 | 7.09 |
| 44343.447916666664 | 6.62 |
| 44343.458333333336 | 6.18 |
| 44343.46875 | 6.1 |
| 44343.479166666664 | 5.89 |
| 44343.489583333336 | 6.28 |
| 44343.5 | 6.3 |
| 44343.510416666664 | 6.24 |
| 44343.520833333336 | 6.11 |
| 44343.53125 | 5.96 |
| 44343.541666666664 | 5.47 |
| 44343.552083333336 | 5.39 |
| 44343.5625 | 5.05 |
| 44343.572916666664 | 5.43 |
| 44343.583333333336 | 4.93 |
| 44343.59375 | 5.51 |
| 44343.604166666664 | 6.22 |
| 44343.614583333336 | 4.87 |
| 44343.625 | 4.54 |
| 44343.635416666664 | 4.92 |
| 44343.645833333336 | 4.79 |
| 44343.65625 | 4.66 |
| 44343.666666666664 | 4.96 |
| 44343.677083333336 | 5.02 |
| 44343.6875 | 5.15 |
| 44343.697916666664 | 5.86 |
| 44343.708333333336 | 5.84 |
| 44343.71875 | 6.22 |
| 44343.729166666664 | 6.47 |
| 44343.739583333336 | 7.85 |
| 44343.75 | 7.53 |
| 44343.760416666664 | 8.78 |
| 44343.770833333336 | 8.76 |
| 44343.78125 | 10.12 |
| 44343.791666666664 | 14.08 |
| 44343.802083333336 | 15.65 |
| 44343.8125 | 16.28 |
| 44343.822916666664 | 17.24 |
| 44343.833333333336 | 18.81 |
| 44343.84375 | 22.98 |
| 44343.854166666664 | 19.1 |
| 44343.864583333336 | 16.95 |
| 44343.875 | 15.77 |
| 44343.885416666664 | 14.67 |
| 44343.895833333336 | 12.85 |
| 44343.90625 | 12.17 |
| 44343.916666666664 | 10.56 |
| 44343.927083333336 | 8.88 |
| 44343.9375 | 7.12 |
| 44343.947916666664 | 5.77 |
| 44343.958333333336 | 5.07 |
| 44343.96875 | 5.29 |
| 44343.979166666664 | 6.18 |
| 44343.989583333336 | 6.6 |
| 44344.0 | 6.63 |
| 44344.010416666664 | 6.67 |
| 44344.020833333336 | 7.05 |
| 44344.03125 | 7.23 |
| 44344.041666666664 | 6.79 |
| 44344.052083333336 | 6.77 |
| 44344.0625 | 7.5 |
| 44344.072916666664 | 6.62 |
| 44344.083333333336 | 6.66 |
| 44344.09375 | 7.99 |
| 44344.104166666664 | 6.39 |
| 44344.114583333336 | 5.89 |
| 44344.125 | 6.41 |
| 44344.135416666664 | 5.83 |
| 44344.145833333336 | 5.84 |
| 44344.15625 | 5.66 |
| 44344.166666666664 | 5.43 |
| 44344.177083333336 | 4.85 |
| 44344.1875 | 4.66 |
| 44344.197916666664 | 4.73 |
| 44344.208333333336 | 4.54 |
| 44344.21875 | 4.27 |
| 44344.229166666664 | 4.75 |
| 44344.239583333336 | 4.33 |
| 44344.25 | 5.12 |
| 44344.260416666664 | 5.15 |
| 44344.270833333336 | 5.45 |
| 44344.28125 | 5.91 |
| 44344.291666666664 | 6.93 |
| 44344.302083333336 | 6.21 |
| 44344.3125 | 6.95 |
| 44344.322916666664 | 7.27 |
| 44344.333333333336 | 7.6 |
| 44344.34375 | 8.23 |
| 44344.354166666664 | 7.75 |
| 44344.364583333336 | 7.94 |
| 44344.375 | 8.76 |
| 44344.385416666664 | 11.1 |
| 44344.395833333336 | 7.69 |
| 44344.40625 | 8.11 |
| 44344.416666666664 | 7.97 |
| 44344.427083333336 | 7.41 |
| 44344.4375 | 7.15 |
| 44344.447916666664 | 6.64 |
| 44344.458333333336 | 6.23 |
| 44344.46875 | 6.06 |
| 44344.479166666664 | 5.88 |
| 44344.489583333336 | 6.08 |
| 44344.5 | 5.89 |
| 44344.510416666664 | 6.13 |
| 44344.520833333336 | 5.77 |
| 44344.53125 | 6.01 |
| 44344.541666666664 | 5.83 |
| 44344.552083333336 | 5.75 |
| 44344.5625 | 5.91 |
| 44344.572916666664 | 6 |
| 44344.583333333336 | 5.55 |
| 44344.59375 | 5.71 |
| 44344.604166666664 | 5.5 |
| 44344.614583333336 | 5.58 |
| 44344.625 | 5.64 |
| 44344.635416666664 | 5.14 |
| 44344.645833333336 | 5.76 |
| 44344.65625 | 5.76 |
| 44344.666666666664 | 4.89 |
| 44344.677083333336 | 5.35 |
| 44344.6875 | 4.87 |
| 44344.697916666664 | 4.79 |
| 44344.708333333336 | 5 |
| 44344.71875 | 4.85 |
| 44344.729166666664 | 5.39 |
| 44344.739583333336 | 5.2 |
| 44344.75 | 5.49 |
| 44344.760416666664 | 5.86 |
| 44344.770833333336 | 6.4 |
| 44344.78125 | 6.68 |
| 44344.791666666664 | 7.37 |
| 44344.802083333336 | 8.63 |
| 44344.8125 | 9.64 |
| 44344.822916666664 | 10.39 |
| 44344.833333333336 | 12.7 |
| 44344.84375 | 14.97 |
| 44344.854166666664 | 16.49 |
| 44344.864583333336 | 18.36 |
| 44344.875 | 19.2 |
| 44344.885416666664 | 17.65 |
| 44344.895833333336 | 16.72 |
| 44344.90625 | 16.83 |
| 44344.916666666664 | 13.45 |
| 44344.927083333336 | 12.97 |
| 44344.9375 | 12 |
| 44344.947916666664 | 10.76 |
| 44344.958333333336 | 9.96 |
| 44344.96875 | 9.65 |
| 44344.979166666664 | 8.59 |
| 44344.989583333336 | 9.18 |
| 44345.0 | 9.62 |
| 44345.010416666664 | 8.78 |
| 44345.020833333336 | 9.55 |
| 44345.03125 | 9.81 |
| 44345.041666666664 | 8.85 |
| 44345.052083333336 | 8.27 |
| 44345.0625 | 9.22 |
| 44345.072916666664 | 9.57 |
| 44345.083333333336 | 8.84 |
| 44345.09375 | 8.55 |
| 44345.104166666664 | 8.56 |
| 44345.114583333336 | 7.49 |
| 44345.125 | 8.26 |
| 44345.135416666664 | 7.29 |
| 44345.145833333336 | 7.59 |
| 44345.15625 | 7.4 |
| 44345.166666666664 | 7.61 |
| 44345.177083333336 | 7.39 |
| 44345.1875 | 6.39 |
| 44345.197916666664 | 6.05 |
| 44345.208333333336 | 5.56 |
| 44345.21875 | 5.41 |
| 44345.229166666664 | 5.17 |
| 44345.239583333336 | 5.91 |
| 44345.25 | 5.23 |
| 44345.260416666664 | 4.99 |
| 44345.270833333336 | 4.94 |
| 44345.28125 | 4.76 |
| 44345.291666666664 | 5.03 |
| 44345.302083333336 | 4.94 |
| 44345.3125 | 5.63 |
| 44345.322916666664 | 5.35 |
| 44345.333333333336 | 5.99 |
| 44345.34375 | 7.85 |
| 44345.354166666664 | 6.87 |
| 44345.364583333336 | 7.52 |
| 44345.375 | 8.88 |
| 44345.385416666664 | 9.77 |
| 44345.395833333336 | 8.69 |
| 44345.40625 | 8.78 |
| 44345.416666666664 | 8.52 |
| 44345.427083333336 | 10.82 |
| 44345.4375 | 8.97 |
| 44345.447916666664 | 8.37 |
| 44345.458333333336 | 7.68 |
| 44345.46875 | 7.22 |
| 44345.479166666664 | 7.01 |
| 44345.489583333336 | 6.63 |
| 44345.5 | 6.49 |
| 44345.510416666664 | 6.39 |
| 44345.520833333336 | 6.83 |
| 44345.53125 | 6.6 |
| 44345.541666666664 | 6.21 |
| 44345.552083333336 | 6.37 |
| 44345.5625 | 6.26 |
| 44345.572916666664 | 6.65 |
| 44345.583333333336 | 6.27 |
| 44345.59375 | 6.43 |
| 44345.604166666664 | 6.17 |
| 44345.614583333336 | 6.25 |
| 44345.625 | 6.34 |
| 44345.635416666664 | 6.51 |
| 44345.645833333336 | 5.9 |
| 44345.65625 | 6.05 |
| 44345.666666666664 | 5.66 |
| 44345.677083333336 | 5.35 |
| 44345.6875 | 5.62 |
| 44345.697916666664 | 6.42 |
| 44345.708333333336 | 6.61 |
| 44345.71875 | 6.65 |
| 44345.729166666664 | 6.64 |
| 44345.739583333336 | 6.5 |
| 44345.75 | 6.54 |
| 44345.760416666664 | 6.64 |
| 44345.770833333336 | 6.82 |
| 44345.78125 | 7.41 |
| 44345.791666666664 | 7.16 |
| 44345.802083333336 | 7.34 |
| 44345.8125 | 7.05 |
| 44345.822916666664 | 7.24 |
| 44345.833333333336 | 7.55 |
| 44345.84375 | 7.94 |
| 44345.854166666664 | 7.67 |
| 44345.864583333336 | 7.21 |
| 44345.875 | 7.66 |
| 44345.885416666664 | 7.87 |
| 44345.895833333336 | 8.49 |
| 44345.90625 | 8.86 |
| 44345.916666666664 | 7.68 |
| 44345.927083333336 | 9.93 |
| 44345.9375 | 10.68 |
| 44345.947916666664 | 9.31 |
| 44345.958333333336 | 9.51 |
| 44345.96875 | 9.08 |
| 44345.979166666664 | 9.05 |
| 44345.989583333336 | 8.54 |
| 44346.0 | 8.7 |
| 44346.010416666664 | 8.65 |
| 44346.020833333336 | 8.45 |
| 44346.03125 | 8.29 |
| 44346.041666666664 | 8.33 |
| 44346.052083333336 | 9.33 |
| 44346.0625 | 9.54 |
| 44346.072916666664 | 9.38 |
| 44346.083333333336 | 9.42 |
| 44346.09375 | 8.89 |
| 44346.104166666664 | 9.25 |
| 44346.114583333336 | 9.08 |
| 44346.125 | 8.61 |
| 44346.135416666664 | 9.06 |
| 44346.145833333336 | 8.73 |
| 44346.15625 | 8.06 |
| 44346.166666666664 | 7.05 |
| 44346.177083333336 | 7.35 |
| 44346.1875 | 7.51 |
| 44346.197916666664 | 6.98 |
| 44346.208333333336 | 6.92 |
| 44346.21875 | 6.18 |
| 44346.229166666664 | 6.24 |
| 44346.239583333336 | 6.28 |
| 44346.25 | 5.4 |
| 44346.260416666664 | 5.93 |
| 44346.270833333336 | 5.65 |
| 44346.28125 | 5.4 |
| 44346.291666666664 | 5.46 |
| 44346.302083333336 | 5.44 |
| 44346.3125 | 5.03 |
| 44346.322916666664 | 5.49 |
| 44346.333333333336 | 5.44 |
| 44346.34375 | 5.03 |
| 44346.354166666664 | 5.92 |
| 44346.364583333336 | 6.1 |
| 44346.375 | 5.39 |
| 44346.385416666664 | 7.06 |
| 44346.395833333336 | 5.58 |
| 44346.40625 | 6.36 |
| 44346.416666666664 | 7.5 |
| 44346.427083333336 | 7.63 |
| 44346.4375 | 8.01 |
| 44346.447916666664 | 7.24 |
| 44346.458333333336 | 7.27 |
| 44346.46875 | 7.22 |
| 44346.479166666664 | 7.57 |
| 44346.489583333336 | 8.67 |
| 44346.5 | 8.02 |
| 44346.510416666664 | 6.97 |
| 44346.520833333336 | 6.59 |
| 44346.53125 | 6.99 |
| 44346.541666666664 | 6.5 |
| 44346.552083333336 | 6.79 |
| 44346.5625 | 7.35 |
| 44346.572916666664 | 7.41 |
| 44346.583333333336 | 7.32 |
| 44346.59375 | 7.4 |
| 44346.604166666664 | 7.53 |
| 44346.614583333336 | 7.69 |
| 44346.625 | 7.77 |
| 44346.635416666664 | 7.4 |
| 44346.645833333336 | 7.31 |
| 44346.65625 | 7.11 |
| 44346.666666666664 | 6.55 |
| 44346.677083333336 | 6.45 |
| 44346.6875 | 6.41 |
| 44346.697916666664 | 6.56 |
| 44346.708333333336 | 10.1 |
| 44346.71875 | 6.04 |
| 44346.729166666664 | 5.47 |
| 44346.739583333336 | 5.85 |
| 44346.75 | 5.27 |
| 44346.760416666664 | 5.45 |
| 44346.770833333336 | 5.49 |
| 44346.78125 | 5.02 |
| 44346.791666666664 | 6.3 |
| 44346.802083333336 | 6.11 |
| 44346.8125 | 5.97 |
| 44346.822916666664 | 5.16 |
| 44346.833333333336 | 5.35 |
| 44346.84375 | 5.9 |
| 44346.854166666664 | 5.43 |
| 44346.864583333336 | 5.26 |
| 44346.875 | 6.1 |
| 44346.885416666664 | 5.84 |
| 44346.895833333336 | 6.56 |
| 44346.90625 | 6.32 |
| 44346.916666666664 | 6.13 |
| 44346.927083333336 | 6.14 |
| 44346.9375 | 6.01 |
| 44346.947916666664 | 6.53 |
| 44346.958333333336 | 6.66 |
| 44346.96875 | 7.29 |
| 44346.979166666664 | 6.06 |
| 44346.989583333336 | 5.96 |
| 44347.0 | 6.01 |
| 44347.010416666664 | 6.22 |
| 44347.020833333336 | 5.79 |
| 44347.03125 | 5.88 |
| 44347.041666666664 | 6.22 |
| 44347.052083333336 | 6.33 |
| 44347.0625 | 5.6 |
| 44347.072916666664 | 5.58 |
| 44347.083333333336 | 5.82 |
| 44347.09375 | 6.17 |
| 44347.104166666664 | 5.57 |
| 44347.114583333336 | 5.12 |
| 44347.125 | 5.05 |
| 44347.135416666664 | 5.72 |
| 44347.145833333336 | 6.23 |
| 44347.15625 | 6.36 |